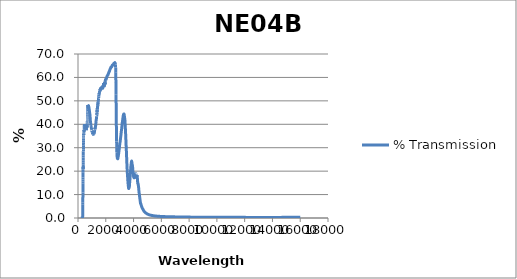
| Category | % Transmission |
|---|---|
| 200.0 | 0.014 |
| 201.0 | 0.014 |
| 202.0 | 0.014 |
| 203.0 | 0.013 |
| 204.0 | 0.013 |
| 205.0 | 0.013 |
| 206.0 | 0.013 |
| 207.0 | 0.013 |
| 208.0 | 0.013 |
| 209.0 | 0.013 |
| 210.0 | 0.013 |
| 211.0 | 0.013 |
| 212.0 | 0.013 |
| 213.0 | 0.013 |
| 214.0 | 0.012 |
| 215.0 | 0.012 |
| 216.0 | 0.012 |
| 217.0 | 0.012 |
| 218.0 | 0.012 |
| 219.0 | 0.012 |
| 220.0 | 0.012 |
| 221.0 | 0.012 |
| 222.0 | 0.012 |
| 223.0 | 0.012 |
| 224.0 | 0.012 |
| 225.0 | 0.012 |
| 226.0 | 0.012 |
| 227.0 | 0.012 |
| 228.0 | 0.011 |
| 229.0 | 0.011 |
| 230.0 | 0.011 |
| 231.0 | 0.011 |
| 232.0 | 0.011 |
| 233.0 | 0.011 |
| 234.0 | 0.011 |
| 235.0 | 0.011 |
| 236.0 | 0.011 |
| 237.0 | 0.011 |
| 238.0 | 0.011 |
| 239.0 | 0.011 |
| 240.0 | 0.011 |
| 241.0 | 0.011 |
| 242.0 | 0.011 |
| 243.0 | 0.011 |
| 244.0 | 0.011 |
| 245.0 | 0.011 |
| 246.0 | 0.011 |
| 247.0 | 0.01 |
| 248.0 | 0.01 |
| 249.0 | 0.01 |
| 250.0 | 0.01 |
| 251.0 | 0.01 |
| 252.0 | 0.01 |
| 253.0 | 0.01 |
| 254.0 | 0.01 |
| 255.0 | 0.01 |
| 256.0 | 0.01 |
| 257.0 | 0.01 |
| 258.0 | 0.01 |
| 259.0 | 0.01 |
| 260.0 | 0.01 |
| 261.0 | 0.01 |
| 262.0 | 0.01 |
| 263.0 | 0.01 |
| 264.0 | 0.01 |
| 265.0 | 0.01 |
| 266.0 | 0.01 |
| 267.0 | 0.01 |
| 268.0 | 0.01 |
| 269.0 | 0.01 |
| 270.0 | 0.01 |
| 271.0 | 0.01 |
| 272.0 | 0.01 |
| 273.0 | 0.01 |
| 274.0 | 0.01 |
| 275.0 | 0.01 |
| 276.0 | 0.009 |
| 277.0 | 0.009 |
| 278.0 | 0.009 |
| 279.0 | 0.009 |
| 280.0 | 0.009 |
| 281.0 | 0.009 |
| 282.0 | 0.009 |
| 283.0 | 0.009 |
| 284.0 | 0.009 |
| 285.0 | 0.009 |
| 286.0 | 0.009 |
| 287.0 | 0.009 |
| 288.0 | 0.009 |
| 289.0 | 0.009 |
| 290.0 | 0.009 |
| 291.0 | 0.009 |
| 292.0 | 0.009 |
| 293.0 | 0.009 |
| 294.0 | 0.009 |
| 295.0 | 0.009 |
| 296.0 | 0.009 |
| 297.0 | 0.009 |
| 298.0 | 0.009 |
| 299.0 | 0.009 |
| 300.0 | 0.009 |
| 301.0 | 0.009 |
| 302.0 | 0.009 |
| 303.0 | 0.009 |
| 304.0 | 0.009 |
| 305.0 | 0.009 |
| 306.0 | 0.009 |
| 307.0 | 0.009 |
| 308.0 | 0.009 |
| 309.0 | 0.009 |
| 310.0 | 0.009 |
| 311.0 | 0.009 |
| 312.0 | 0.008 |
| 313.0 | 0.008 |
| 314.0 | 0.008 |
| 315.0 | 0.009 |
| 316.0 | 0.009 |
| 317.0 | 0.009 |
| 318.0 | 0.009 |
| 319.0 | 0.009 |
| 320.0 | 0.01 |
| 321.0 | 0.012 |
| 322.0 | 0.016 |
| 323.0 | 0.021 |
| 324.0 | 0.029 |
| 325.0 | 0.041 |
| 326.0 | 0.059 |
| 327.0 | 0.085 |
| 328.0 | 0.121 |
| 329.0 | 0.169 |
| 330.0 | 0.232 |
| 331.0 | 0.314 |
| 332.0 | 0.415 |
| 333.0 | 0.539 |
| 334.0 | 0.689 |
| 335.0 | 0.864 |
| 336.0 | 1.076 |
| 337.0 | 1.328 |
| 338.0 | 1.615 |
| 339.0 | 1.95 |
| 340.0 | 2.317 |
| 341.0 | 2.71 |
| 342.0 | 3.146 |
| 343.0 | 3.609 |
| 344.0 | 4.122 |
| 345.0 | 4.671 |
| 346.0 | 5.268 |
| 347.0 | 5.849 |
| 348.0 | 6.501 |
| 349.0 | 7.184 |
| 350.0 | 7.915 |
| 351.0 | 8.671 |
| 352.0 | 9.423 |
| 353.0 | 10.109 |
| 354.0 | 10.876 |
| 355.0 | 11.64 |
| 356.0 | 12.471 |
| 357.0 | 13.306 |
| 358.0 | 14.129 |
| 359.0 | 14.825 |
| 360.0 | 15.651 |
| 361.0 | 16.417 |
| 362.0 | 17.251 |
| 363.0 | 18.032 |
| 364.0 | 18.768 |
| 365.0 | 19.354 |
| 366.0 | 20.043 |
| 367.0 | 20.587 |
| 368.0 | 21.141 |
| 369.0 | 21.621 |
| 370.0 | 21.908 |
| 371.0 | 21.957 |
| 372.0 | 21.927 |
| 373.0 | 21.721 |
| 374.0 | 21.499 |
| 375.0 | 21.261 |
| 376.0 | 21.044 |
| 377.0 | 20.895 |
| 378.0 | 21.173 |
| 379.0 | 21.612 |
| 380.0 | 22.243 |
| 381.0 | 22.912 |
| 382.0 | 23.807 |
| 383.0 | 24.694 |
| 384.0 | 25.788 |
| 385.0 | 26.821 |
| 386.0 | 27.727 |
| 387.0 | 28.405 |
| 388.0 | 29.284 |
| 389.0 | 30.03 |
| 390.0 | 30.824 |
| 391.0 | 31.533 |
| 392.0 | 32.12 |
| 393.0 | 32.421 |
| 394.0 | 32.936 |
| 395.0 | 33.403 |
| 396.0 | 33.937 |
| 397.0 | 34.357 |
| 398.0 | 34.65 |
| 399.0 | 34.695 |
| 400.0 | 34.957 |
| 401.0 | 35.078 |
| 402.0 | 35.328 |
| 403.0 | 35.605 |
| 404.0 | 35.725 |
| 405.0 | 35.484 |
| 406.0 | 35.491 |
| 407.0 | 35.552 |
| 408.0 | 35.72 |
| 409.0 | 35.763 |
| 410.0 | 35.706 |
| 411.0 | 35.513 |
| 412.0 | 35.542 |
| 413.0 | 35.61 |
| 414.0 | 35.714 |
| 415.0 | 35.903 |
| 416.0 | 35.92 |
| 417.0 | 35.815 |
| 418.0 | 35.901 |
| 419.0 | 36.111 |
| 420.0 | 36.296 |
| 421.0 | 36.531 |
| 422.0 | 36.579 |
| 423.0 | 36.506 |
| 424.0 | 36.611 |
| 425.0 | 36.811 |
| 426.0 | 37 |
| 427.0 | 37.225 |
| 428.0 | 37.27 |
| 429.0 | 37.184 |
| 430.0 | 37.217 |
| 431.0 | 37.282 |
| 432.0 | 37.375 |
| 433.0 | 37.427 |
| 434.0 | 37.357 |
| 435.0 | 37.225 |
| 436.0 | 37.156 |
| 437.0 | 37.15 |
| 438.0 | 37.191 |
| 439.0 | 37.335 |
| 440.0 | 37.315 |
| 441.0 | 37.159 |
| 442.0 | 37.176 |
| 443.0 | 37.343 |
| 444.0 | 37.511 |
| 445.0 | 37.74 |
| 446.0 | 37.821 |
| 447.0 | 37.85 |
| 448.0 | 38.027 |
| 449.0 | 38.209 |
| 450.0 | 38.467 |
| 451.0 | 38.783 |
| 452.0 | 38.897 |
| 453.0 | 38.87 |
| 454.0 | 39.03 |
| 455.0 | 39.162 |
| 456.0 | 39.364 |
| 457.0 | 39.58 |
| 458.0 | 39.622 |
| 459.0 | 39.539 |
| 460.0 | 39.544 |
| 461.0 | 39.599 |
| 462.0 | 39.8 |
| 463.0 | 39.984 |
| 464.0 | 39.869 |
| 465.0 | 39.673 |
| 466.0 | 39.695 |
| 467.0 | 39.631 |
| 468.0 | 39.751 |
| 469.0 | 39.915 |
| 470.0 | 39.73 |
| 471.0 | 39.461 |
| 472.0 | 39.421 |
| 473.0 | 39.383 |
| 474.0 | 39.466 |
| 475.0 | 39.574 |
| 476.0 | 39.414 |
| 477.0 | 39.154 |
| 478.0 | 39.105 |
| 479.0 | 39.043 |
| 480.0 | 39.098 |
| 481.0 | 39.18 |
| 482.0 | 38.994 |
| 483.0 | 38.76 |
| 484.0 | 38.713 |
| 485.0 | 38.649 |
| 486.0 | 38.707 |
| 487.0 | 38.753 |
| 488.0 | 38.607 |
| 489.0 | 38.439 |
| 490.0 | 38.406 |
| 491.0 | 38.359 |
| 492.0 | 38.407 |
| 493.0 | 38.47 |
| 494.0 | 38.325 |
| 495.0 | 38.166 |
| 496.0 | 38.145 |
| 497.0 | 38.157 |
| 498.0 | 38.235 |
| 499.0 | 38.259 |
| 500.0 | 38.136 |
| 501.0 | 37.986 |
| 502.0 | 37.975 |
| 503.0 | 38.002 |
| 504.0 | 38.087 |
| 505.0 | 38.188 |
| 506.0 | 38.071 |
| 507.0 | 37.942 |
| 508.0 | 37.948 |
| 509.0 | 37.961 |
| 510.0 | 38.061 |
| 511.0 | 38.17 |
| 512.0 | 38.08 |
| 513.0 | 38.018 |
| 514.0 | 38.054 |
| 515.0 | 38.093 |
| 516.0 | 38.249 |
| 517.0 | 38.371 |
| 518.0 | 38.298 |
| 519.0 | 38.241 |
| 520.0 | 38.254 |
| 521.0 | 38.337 |
| 522.0 | 38.503 |
| 523.0 | 38.612 |
| 524.0 | 38.558 |
| 525.0 | 38.535 |
| 526.0 | 38.59 |
| 527.0 | 38.659 |
| 528.0 | 38.819 |
| 529.0 | 38.97 |
| 530.0 | 38.922 |
| 531.0 | 38.887 |
| 532.0 | 38.959 |
| 533.0 | 39.034 |
| 534.0 | 39.155 |
| 535.0 | 39.303 |
| 536.0 | 39.274 |
| 537.0 | 39.272 |
| 538.0 | 39.343 |
| 539.0 | 39.401 |
| 540.0 | 39.614 |
| 541.0 | 39.674 |
| 542.0 | 39.533 |
| 543.0 | 39.517 |
| 544.0 | 39.53 |
| 545.0 | 39.676 |
| 546.0 | 39.809 |
| 547.0 | 39.864 |
| 548.0 | 39.697 |
| 549.0 | 39.63 |
| 550.0 | 39.633 |
| 551.0 | 39.704 |
| 552.0 | 39.802 |
| 553.0 | 39.659 |
| 554.0 | 39.559 |
| 555.0 | 39.51 |
| 556.0 | 39.521 |
| 557.0 | 39.582 |
| 558.0 | 39.53 |
| 559.0 | 39.574 |
| 560.0 | 39.389 |
| 561.0 | 39.413 |
| 562.0 | 39.271 |
| 563.0 | 39.17 |
| 564.0 | 39.159 |
| 565.0 | 39.142 |
| 566.0 | 39.191 |
| 567.0 | 39.055 |
| 568.0 | 38.849 |
| 569.0 | 38.756 |
| 570.0 | 38.643 |
| 571.0 | 38.659 |
| 572.0 | 38.739 |
| 573.0 | 38.537 |
| 574.0 | 38.367 |
| 575.0 | 38.325 |
| 576.0 | 38.181 |
| 577.0 | 38.236 |
| 578.0 | 38.269 |
| 579.0 | 38.132 |
| 580.0 | 37.913 |
| 581.0 | 37.882 |
| 582.0 | 37.764 |
| 583.0 | 37.847 |
| 584.0 | 37.907 |
| 585.0 | 37.739 |
| 586.0 | 37.653 |
| 587.0 | 37.632 |
| 588.0 | 37.529 |
| 589.0 | 37.653 |
| 590.0 | 37.727 |
| 591.0 | 37.577 |
| 592.0 | 37.541 |
| 593.0 | 37.611 |
| 594.0 | 37.501 |
| 595.0 | 37.678 |
| 596.0 | 37.788 |
| 597.0 | 37.707 |
| 598.0 | 37.63 |
| 599.0 | 37.754 |
| 600.0 | 37.744 |
| 601.0 | 37.883 |
| 602.0 | 37.961 |
| 603.0 | 37.889 |
| 604.0 | 37.871 |
| 605.0 | 37.997 |
| 606.0 | 37.952 |
| 607.0 | 38.136 |
| 608.0 | 38.288 |
| 609.0 | 38.19 |
| 610.0 | 38.169 |
| 611.0 | 38.293 |
| 612.0 | 38.287 |
| 613.0 | 38.448 |
| 614.0 | 38.58 |
| 615.0 | 38.467 |
| 616.0 | 38.475 |
| 617.0 | 38.549 |
| 618.0 | 38.576 |
| 619.0 | 38.727 |
| 620.0 | 38.843 |
| 621.0 | 38.678 |
| 622.0 | 38.718 |
| 623.0 | 38.772 |
| 624.0 | 38.737 |
| 625.0 | 38.912 |
| 626.0 | 39.067 |
| 627.0 | 38.807 |
| 628.0 | 38.819 |
| 629.0 | 38.856 |
| 630.0 | 38.909 |
| 631.0 | 38.961 |
| 632.0 | 39.06 |
| 633.0 | 38.803 |
| 634.0 | 38.804 |
| 635.0 | 38.839 |
| 636.0 | 38.807 |
| 637.0 | 38.887 |
| 638.0 | 39.025 |
| 639.0 | 38.837 |
| 640.0 | 38.768 |
| 641.0 | 38.768 |
| 642.0 | 38.826 |
| 643.0 | 38.887 |
| 644.0 | 38.872 |
| 645.0 | 38.784 |
| 646.0 | 38.782 |
| 647.0 | 38.852 |
| 648.0 | 38.858 |
| 649.0 | 38.941 |
| 650.0 | 39.1 |
| 651.0 | 38.953 |
| 652.0 | 38.97 |
| 653.0 | 38.979 |
| 654.0 | 38.99 |
| 655.0 | 39.248 |
| 656.0 | 39.431 |
| 657.0 | 39.194 |
| 658.0 | 39.235 |
| 659.0 | 39.395 |
| 660.0 | 39.432 |
| 661.0 | 39.67 |
| 662.0 | 39.79 |
| 663.0 | 39.714 |
| 664.0 | 39.721 |
| 665.0 | 40.02 |
| 666.0 | 40.038 |
| 667.0 | 40.316 |
| 668.0 | 40.615 |
| 669.0 | 40.581 |
| 670.0 | 40.635 |
| 671.0 | 40.872 |
| 672.0 | 41.097 |
| 673.0 | 41.4 |
| 674.0 | 41.468 |
| 675.0 | 41.52 |
| 676.0 | 41.605 |
| 677.0 | 41.969 |
| 678.0 | 42.021 |
| 679.0 | 42.516 |
| 680.0 | 42.697 |
| 681.0 | 42.777 |
| 682.0 | 42.97 |
| 683.0 | 43.318 |
| 684.0 | 43.426 |
| 685.0 | 43.812 |
| 686.0 | 43.896 |
| 687.0 | 44.071 |
| 688.0 | 44.147 |
| 689.0 | 44.659 |
| 690.0 | 44.64 |
| 691.0 | 44.746 |
| 692.0 | 45.063 |
| 693.0 | 45.398 |
| 694.0 | 45.428 |
| 695.0 | 45.652 |
| 696.0 | 45.692 |
| 697.0 | 46.054 |
| 698.0 | 46.145 |
| 699.0 | 46.254 |
| 700.0 | 46.209 |
| 701.0 | 46.462 |
| 702.0 | 46.462 |
| 703.0 | 46.744 |
| 704.0 | 46.976 |
| 705.0 | 46.895 |
| 706.0 | 46.892 |
| 707.0 | 46.941 |
| 708.0 | 46.922 |
| 709.0 | 47.31 |
| 710.0 | 47.553 |
| 711.0 | 47.272 |
| 712.0 | 47.367 |
| 713.0 | 47.536 |
| 714.0 | 47.573 |
| 715.0 | 47.817 |
| 716.0 | 47.808 |
| 717.0 | 47.767 |
| 718.0 | 47.685 |
| 719.0 | 47.78 |
| 720.0 | 47.71 |
| 721.0 | 47.998 |
| 722.0 | 48.028 |
| 723.0 | 47.787 |
| 724.0 | 47.852 |
| 725.0 | 47.916 |
| 726.0 | 47.904 |
| 727.0 | 48.005 |
| 728.0 | 48.06 |
| 729.0 | 47.864 |
| 730.0 | 47.927 |
| 731.0 | 47.908 |
| 732.0 | 47.854 |
| 733.0 | 48.018 |
| 734.0 | 48.174 |
| 735.0 | 47.877 |
| 736.0 | 47.867 |
| 737.0 | 47.995 |
| 738.0 | 47.888 |
| 739.0 | 48.028 |
| 740.0 | 48.169 |
| 741.0 | 47.812 |
| 742.0 | 47.856 |
| 743.0 | 47.888 |
| 744.0 | 47.872 |
| 745.0 | 47.926 |
| 746.0 | 48.109 |
| 747.0 | 47.722 |
| 748.0 | 47.665 |
| 749.0 | 47.642 |
| 750.0 | 47.9 |
| 751.0 | 47.9 |
| 752.0 | 47.901 |
| 753.0 | 47.91 |
| 754.0 | 47.899 |
| 755.0 | 47.882 |
| 756.0 | 47.876 |
| 757.0 | 47.867 |
| 758.0 | 47.858 |
| 759.0 | 47.854 |
| 760.0 | 47.837 |
| 761.0 | 47.817 |
| 762.0 | 47.803 |
| 763.0 | 47.787 |
| 764.0 | 47.774 |
| 765.0 | 47.765 |
| 766.0 | 47.742 |
| 767.0 | 47.71 |
| 768.0 | 47.687 |
| 769.0 | 47.663 |
| 770.0 | 47.639 |
| 771.0 | 47.621 |
| 772.0 | 47.591 |
| 773.0 | 47.553 |
| 774.0 | 47.526 |
| 775.0 | 47.499 |
| 776.0 | 47.474 |
| 777.0 | 47.451 |
| 778.0 | 47.418 |
| 779.0 | 47.374 |
| 780.0 | 47.341 |
| 781.0 | 47.313 |
| 782.0 | 47.288 |
| 783.0 | 47.261 |
| 784.0 | 47.224 |
| 785.0 | 47.176 |
| 786.0 | 47.136 |
| 787.0 | 47.104 |
| 788.0 | 47.073 |
| 789.0 | 47.043 |
| 790.0 | 47.004 |
| 791.0 | 46.959 |
| 792.0 | 46.923 |
| 793.0 | 46.884 |
| 794.0 | 46.851 |
| 795.0 | 46.819 |
| 796.0 | 46.775 |
| 797.0 | 46.726 |
| 798.0 | 46.686 |
| 799.0 | 46.648 |
| 800.0 | 46.617 |
| 801.0 | 46.584 |
| 802.0 | 46.541 |
| 803.0 | 46.491 |
| 804.0 | 46.447 |
| 805.0 | 46.408 |
| 806.0 | 46.373 |
| 807.0 | 46.334 |
| 808.0 | 46.289 |
| 809.0 | 46.239 |
| 810.0 | 46.199 |
| 811.0 | 46.157 |
| 812.0 | 46.115 |
| 813.0 | 46.069 |
| 814.0 | 46.023 |
| 815.0 | 45.982 |
| 816.0 | 45.944 |
| 817.0 | 45.901 |
| 818.0 | 45.86 |
| 819.0 | 45.815 |
| 820.0 | 45.766 |
| 821.0 | 45.721 |
| 822.0 | 45.682 |
| 823.0 | 45.637 |
| 824.0 | 45.586 |
| 825.0 | 45.542 |
| 826.0 | 45.493 |
| 827.0 | 45.446 |
| 828.0 | 45.409 |
| 829.0 | 45.368 |
| 830.0 | 45.323 |
| 831.0 | 45.279 |
| 832.0 | 45.231 |
| 833.0 | 45.188 |
| 834.0 | 45.15 |
| 835.0 | 45.106 |
| 836.0 | 45.06 |
| 837.0 | 45.016 |
| 838.0 | 44.969 |
| 839.0 | 44.927 |
| 840.0 | 44.885 |
| 841.0 | 44.839 |
| 842.0 | 44.793 |
| 843.0 | 44.752 |
| 844.0 | 44.706 |
| 845.0 | 44.663 |
| 846.0 | 44.624 |
| 847.0 | 44.576 |
| 848.0 | 44.524 |
| 849.0 | 44.48 |
| 850.0 | 44.437 |
| 851.0 | 44.397 |
| 852.0 | 44.36 |
| 853.0 | 44.311 |
| 854.0 | 44.261 |
| 855.0 | 44.219 |
| 856.0 | 44.185 |
| 857.0 | 44.147 |
| 858.0 | 44.107 |
| 859.0 | 44.06 |
| 860.0 | 44.012 |
| 861.0 | 43.96 |
| 862.0 | 43.895 |
| 863.0 | 43.838 |
| 864.0 | 43.771 |
| 865.0 | 43.697 |
| 866.0 | 43.616 |
| 867.0 | 43.528 |
| 868.0 | 43.448 |
| 869.0 | 43.379 |
| 870.0 | 43.328 |
| 871.0 | 43.27 |
| 872.0 | 43.174 |
| 873.0 | 43.053 |
| 874.0 | 42.934 |
| 875.0 | 42.847 |
| 876.0 | 42.793 |
| 877.0 | 42.738 |
| 878.0 | 42.67 |
| 879.0 | 42.602 |
| 880.0 | 42.539 |
| 881.0 | 42.441 |
| 882.0 | 42.326 |
| 883.0 | 42.223 |
| 884.0 | 42.116 |
| 885.0 | 42.012 |
| 886.0 | 41.934 |
| 887.0 | 41.883 |
| 888.0 | 41.836 |
| 889.0 | 41.764 |
| 890.0 | 41.661 |
| 891.0 | 41.554 |
| 892.0 | 41.445 |
| 893.0 | 41.37 |
| 894.0 | 41.339 |
| 895.0 | 41.305 |
| 896.0 | 41.259 |
| 897.0 | 41.203 |
| 898.0 | 41.159 |
| 899.0 | 41.138 |
| 900.0 | 41.089 |
| 901.0 | 41.011 |
| 902.0 | 40.928 |
| 903.0 | 40.857 |
| 904.0 | 40.807 |
| 905.0 | 40.779 |
| 906.0 | 40.766 |
| 907.0 | 40.731 |
| 908.0 | 40.642 |
| 909.0 | 40.556 |
| 910.0 | 40.527 |
| 911.0 | 40.512 |
| 912.0 | 40.464 |
| 913.0 | 40.407 |
| 914.0 | 40.373 |
| 915.0 | 40.365 |
| 916.0 | 40.366 |
| 917.0 | 40.343 |
| 918.0 | 40.28 |
| 919.0 | 40.197 |
| 920.0 | 40.095 |
| 921.0 | 40.019 |
| 922.0 | 39.993 |
| 923.0 | 39.987 |
| 924.0 | 39.982 |
| 925.0 | 39.947 |
| 926.0 | 39.857 |
| 927.0 | 39.771 |
| 928.0 | 39.74 |
| 929.0 | 39.707 |
| 930.0 | 39.623 |
| 931.0 | 39.556 |
| 932.0 | 39.557 |
| 933.0 | 39.543 |
| 934.0 | 39.494 |
| 935.0 | 39.458 |
| 936.0 | 39.423 |
| 937.0 | 39.406 |
| 938.0 | 39.4 |
| 939.0 | 39.361 |
| 940.0 | 39.307 |
| 941.0 | 39.254 |
| 942.0 | 39.196 |
| 943.0 | 39.138 |
| 944.0 | 39.091 |
| 945.0 | 39.075 |
| 946.0 | 39.026 |
| 947.0 | 38.964 |
| 948.0 | 38.944 |
| 949.0 | 38.943 |
| 950.0 | 38.908 |
| 951.0 | 38.834 |
| 952.0 | 38.809 |
| 953.0 | 38.816 |
| 954.0 | 38.785 |
| 955.0 | 38.714 |
| 956.0 | 38.64 |
| 957.0 | 38.589 |
| 958.0 | 38.594 |
| 959.0 | 38.57 |
| 960.0 | 38.495 |
| 961.0 | 38.445 |
| 962.0 | 38.436 |
| 963.0 | 38.431 |
| 964.0 | 38.378 |
| 965.0 | 38.333 |
| 966.0 | 38.325 |
| 967.0 | 38.275 |
| 968.0 | 38.231 |
| 969.0 | 38.219 |
| 970.0 | 38.176 |
| 971.0 | 38.118 |
| 972.0 | 38.09 |
| 973.0 | 38.084 |
| 974.0 | 38.013 |
| 975.0 | 37.972 |
| 976.0 | 37.962 |
| 977.0 | 37.948 |
| 978.0 | 37.927 |
| 979.0 | 37.86 |
| 980.0 | 37.772 |
| 981.0 | 37.701 |
| 982.0 | 37.716 |
| 983.0 | 37.736 |
| 984.0 | 37.708 |
| 985.0 | 37.653 |
| 986.0 | 37.644 |
| 987.0 | 37.633 |
| 988.0 | 37.598 |
| 989.0 | 37.555 |
| 990.0 | 37.514 |
| 991.0 | 37.489 |
| 992.0 | 37.462 |
| 993.0 | 37.463 |
| 994.0 | 37.473 |
| 995.0 | 37.429 |
| 996.0 | 37.356 |
| 997.0 | 37.3 |
| 998.0 | 37.273 |
| 999.0 | 37.271 |
| 1000.0 | 37.267 |
| 1001.0 | 37.19 |
| 1002.0 | 37.141 |
| 1003.0 | 37.141 |
| 1004.0 | 37.148 |
| 1005.0 | 37.125 |
| 1006.0 | 37.112 |
| 1007.0 | 37.081 |
| 1008.0 | 37.043 |
| 1009.0 | 37.007 |
| 1010.0 | 36.995 |
| 1011.0 | 37.007 |
| 1012.0 | 37.031 |
| 1013.0 | 37.044 |
| 1014.0 | 36.995 |
| 1015.0 | 36.955 |
| 1016.0 | 36.908 |
| 1017.0 | 36.878 |
| 1018.0 | 36.863 |
| 1019.0 | 36.849 |
| 1020.0 | 36.85 |
| 1021.0 | 36.833 |
| 1022.0 | 36.772 |
| 1023.0 | 36.699 |
| 1024.0 | 36.703 |
| 1025.0 | 36.68 |
| 1026.0 | 36.635 |
| 1027.0 | 36.591 |
| 1028.0 | 36.569 |
| 1029.0 | 36.598 |
| 1030.0 | 36.592 |
| 1031.0 | 36.582 |
| 1032.0 | 36.562 |
| 1033.0 | 36.546 |
| 1034.0 | 36.501 |
| 1035.0 | 36.492 |
| 1036.0 | 36.493 |
| 1037.0 | 36.486 |
| 1038.0 | 36.485 |
| 1039.0 | 36.447 |
| 1040.0 | 36.367 |
| 1041.0 | 36.317 |
| 1042.0 | 36.33 |
| 1043.0 | 36.332 |
| 1044.0 | 36.286 |
| 1045.0 | 36.247 |
| 1046.0 | 36.215 |
| 1047.0 | 36.197 |
| 1048.0 | 36.229 |
| 1049.0 | 36.237 |
| 1050.0 | 36.192 |
| 1051.0 | 36.16 |
| 1052.0 | 36.142 |
| 1053.0 | 36.13 |
| 1054.0 | 36.12 |
| 1055.0 | 36.119 |
| 1056.0 | 36.098 |
| 1057.0 | 36.061 |
| 1058.0 | 36.03 |
| 1059.0 | 36.031 |
| 1060.0 | 36.036 |
| 1061.0 | 35.993 |
| 1062.0 | 35.989 |
| 1063.0 | 35.984 |
| 1064.0 | 35.998 |
| 1065.0 | 36.027 |
| 1066.0 | 36.04 |
| 1067.0 | 36.005 |
| 1068.0 | 35.961 |
| 1069.0 | 35.923 |
| 1070.0 | 35.858 |
| 1071.0 | 35.827 |
| 1072.0 | 35.89 |
| 1073.0 | 35.947 |
| 1074.0 | 35.948 |
| 1075.0 | 35.936 |
| 1076.0 | 35.905 |
| 1077.0 | 35.859 |
| 1078.0 | 35.839 |
| 1079.0 | 35.868 |
| 1080.0 | 35.885 |
| 1081.0 | 35.877 |
| 1082.0 | 35.876 |
| 1083.0 | 35.883 |
| 1084.0 | 35.845 |
| 1085.0 | 35.824 |
| 1086.0 | 35.866 |
| 1087.0 | 35.912 |
| 1088.0 | 35.921 |
| 1089.0 | 35.942 |
| 1090.0 | 35.962 |
| 1091.0 | 35.951 |
| 1092.0 | 35.922 |
| 1093.0 | 35.892 |
| 1094.0 | 35.87 |
| 1095.0 | 35.854 |
| 1096.0 | 35.834 |
| 1097.0 | 35.829 |
| 1098.0 | 35.836 |
| 1099.0 | 35.824 |
| 1100.0 | 35.784 |
| 1101.0 | 35.768 |
| 1102.0 | 35.829 |
| 1103.0 | 35.882 |
| 1104.0 | 35.887 |
| 1105.0 | 35.876 |
| 1106.0 | 35.862 |
| 1107.0 | 35.85 |
| 1108.0 | 35.83 |
| 1109.0 | 35.819 |
| 1110.0 | 35.793 |
| 1111.0 | 35.735 |
| 1112.0 | 35.708 |
| 1113.0 | 35.706 |
| 1114.0 | 35.699 |
| 1115.0 | 35.705 |
| 1116.0 | 35.757 |
| 1117.0 | 35.794 |
| 1118.0 | 35.786 |
| 1119.0 | 35.773 |
| 1120.0 | 35.767 |
| 1121.0 | 35.777 |
| 1122.0 | 35.801 |
| 1123.0 | 35.837 |
| 1124.0 | 35.869 |
| 1125.0 | 35.889 |
| 1126.0 | 35.87 |
| 1127.0 | 35.904 |
| 1128.0 | 35.943 |
| 1129.0 | 35.984 |
| 1130.0 | 36.01 |
| 1131.0 | 36 |
| 1132.0 | 35.963 |
| 1133.0 | 35.939 |
| 1134.0 | 35.904 |
| 1135.0 | 35.932 |
| 1136.0 | 35.937 |
| 1137.0 | 35.936 |
| 1138.0 | 35.953 |
| 1139.0 | 35.985 |
| 1140.0 | 36.042 |
| 1141.0 | 36.073 |
| 1142.0 | 36.089 |
| 1143.0 | 36.087 |
| 1144.0 | 36.034 |
| 1145.0 | 35.992 |
| 1146.0 | 35.985 |
| 1147.0 | 36.029 |
| 1148.0 | 36.057 |
| 1149.0 | 36.106 |
| 1150.0 | 36.142 |
| 1151.0 | 36.176 |
| 1152.0 | 36.209 |
| 1153.0 | 36.19 |
| 1154.0 | 36.162 |
| 1155.0 | 36.139 |
| 1156.0 | 36.135 |
| 1157.0 | 36.128 |
| 1158.0 | 36.106 |
| 1159.0 | 36.049 |
| 1160.0 | 36.051 |
| 1161.0 | 36.058 |
| 1162.0 | 36.088 |
| 1163.0 | 36.146 |
| 1164.0 | 36.259 |
| 1165.0 | 36.34 |
| 1166.0 | 36.387 |
| 1167.0 | 36.367 |
| 1168.0 | 36.36 |
| 1169.0 | 36.375 |
| 1170.0 | 36.376 |
| 1171.0 | 36.372 |
| 1172.0 | 36.379 |
| 1173.0 | 36.412 |
| 1174.0 | 36.459 |
| 1175.0 | 36.492 |
| 1176.0 | 36.51 |
| 1177.0 | 36.546 |
| 1178.0 | 36.603 |
| 1179.0 | 36.609 |
| 1180.0 | 36.628 |
| 1181.0 | 36.641 |
| 1182.0 | 36.665 |
| 1183.0 | 36.703 |
| 1184.0 | 36.741 |
| 1185.0 | 36.81 |
| 1186.0 | 36.896 |
| 1187.0 | 36.997 |
| 1188.0 | 37.123 |
| 1189.0 | 37.274 |
| 1190.0 | 37.401 |
| 1191.0 | 37.445 |
| 1192.0 | 37.436 |
| 1193.0 | 37.423 |
| 1194.0 | 37.41 |
| 1195.0 | 37.411 |
| 1196.0 | 37.409 |
| 1197.0 | 37.415 |
| 1198.0 | 37.458 |
| 1199.0 | 37.493 |
| 1200.0 | 37.518 |
| 1201.0 | 37.531 |
| 1202.0 | 37.572 |
| 1203.0 | 37.628 |
| 1204.0 | 37.693 |
| 1205.0 | 37.785 |
| 1206.0 | 37.882 |
| 1207.0 | 37.981 |
| 1208.0 | 38.092 |
| 1209.0 | 38.158 |
| 1210.0 | 38.164 |
| 1211.0 | 38.157 |
| 1212.0 | 38.149 |
| 1213.0 | 38.13 |
| 1214.0 | 38.11 |
| 1215.0 | 38.082 |
| 1216.0 | 38.048 |
| 1217.0 | 38.028 |
| 1218.0 | 38.019 |
| 1219.0 | 38.026 |
| 1220.0 | 37.998 |
| 1221.0 | 37.933 |
| 1222.0 | 37.902 |
| 1223.0 | 37.951 |
| 1224.0 | 38.005 |
| 1225.0 | 38.032 |
| 1226.0 | 38.032 |
| 1227.0 | 38.037 |
| 1228.0 | 38.059 |
| 1229.0 | 38.082 |
| 1230.0 | 38.062 |
| 1231.0 | 38.042 |
| 1232.0 | 38.033 |
| 1233.0 | 38.031 |
| 1234.0 | 38.037 |
| 1235.0 | 38.069 |
| 1236.0 | 38.086 |
| 1237.0 | 38.087 |
| 1238.0 | 38.099 |
| 1239.0 | 38.133 |
| 1240.0 | 38.176 |
| 1241.0 | 38.235 |
| 1242.0 | 38.311 |
| 1243.0 | 38.394 |
| 1244.0 | 38.476 |
| 1245.0 | 38.549 |
| 1246.0 | 38.601 |
| 1247.0 | 38.652 |
| 1248.0 | 38.7 |
| 1249.0 | 38.732 |
| 1250.0 | 38.747 |
| 1251.0 | 38.746 |
| 1252.0 | 38.767 |
| 1253.0 | 38.784 |
| 1254.0 | 38.778 |
| 1255.0 | 38.768 |
| 1256.0 | 38.765 |
| 1257.0 | 38.795 |
| 1258.0 | 38.876 |
| 1259.0 | 38.987 |
| 1260.0 | 39.113 |
| 1261.0 | 39.24 |
| 1262.0 | 39.336 |
| 1263.0 | 39.383 |
| 1264.0 | 39.418 |
| 1265.0 | 39.462 |
| 1266.0 | 39.485 |
| 1267.0 | 39.478 |
| 1268.0 | 39.475 |
| 1269.0 | 39.476 |
| 1270.0 | 39.476 |
| 1271.0 | 39.484 |
| 1272.0 | 39.492 |
| 1273.0 | 39.506 |
| 1274.0 | 39.528 |
| 1275.0 | 39.558 |
| 1276.0 | 39.603 |
| 1277.0 | 39.659 |
| 1278.0 | 39.725 |
| 1279.0 | 39.773 |
| 1280.0 | 39.819 |
| 1281.0 | 39.858 |
| 1282.0 | 39.892 |
| 1283.0 | 39.961 |
| 1284.0 | 40.07 |
| 1285.0 | 40.186 |
| 1286.0 | 40.295 |
| 1287.0 | 40.404 |
| 1288.0 | 40.509 |
| 1289.0 | 40.59 |
| 1290.0 | 40.649 |
| 1291.0 | 40.689 |
| 1292.0 | 40.706 |
| 1293.0 | 40.688 |
| 1294.0 | 40.688 |
| 1295.0 | 40.75 |
| 1296.0 | 40.843 |
| 1297.0 | 40.952 |
| 1298.0 | 41.069 |
| 1299.0 | 41.199 |
| 1300.0 | 41.317 |
| 1301.0 | 41.386 |
| 1302.0 | 41.427 |
| 1303.0 | 41.465 |
| 1304.0 | 41.511 |
| 1305.0 | 41.569 |
| 1306.0 | 41.638 |
| 1307.0 | 41.7 |
| 1308.0 | 41.737 |
| 1309.0 | 41.742 |
| 1310.0 | 41.759 |
| 1311.0 | 41.803 |
| 1312.0 | 41.858 |
| 1313.0 | 41.936 |
| 1314.0 | 42.028 |
| 1315.0 | 42.087 |
| 1316.0 | 42.121 |
| 1317.0 | 42.153 |
| 1318.0 | 42.189 |
| 1319.0 | 42.212 |
| 1320.0 | 42.224 |
| 1321.0 | 42.247 |
| 1322.0 | 42.282 |
| 1323.0 | 42.32 |
| 1324.0 | 42.371 |
| 1325.0 | 42.451 |
| 1326.0 | 42.546 |
| 1327.0 | 42.637 |
| 1328.0 | 42.707 |
| 1329.0 | 42.727 |
| 1330.0 | 42.724 |
| 1331.0 | 42.707 |
| 1332.0 | 42.707 |
| 1333.0 | 42.745 |
| 1334.0 | 42.799 |
| 1335.0 | 42.849 |
| 1336.0 | 42.895 |
| 1337.0 | 42.938 |
| 1338.0 | 42.98 |
| 1339.0 | 43.035 |
| 1340.0 | 43.143 |
| 1341.0 | 43.342 |
| 1342.0 | 43.541 |
| 1343.0 | 43.657 |
| 1344.0 | 43.702 |
| 1345.0 | 43.711 |
| 1346.0 | 43.765 |
| 1347.0 | 43.872 |
| 1348.0 | 44.004 |
| 1349.0 | 44.104 |
| 1350.0 | 44.195 |
| 1351.0 | 44.254 |
| 1352.0 | 44.231 |
| 1353.0 | 44.198 |
| 1354.0 | 44.242 |
| 1355.0 | 44.433 |
| 1356.0 | 44.631 |
| 1357.0 | 44.696 |
| 1358.0 | 44.609 |
| 1359.0 | 44.415 |
| 1360.0 | 44.285 |
| 1361.0 | 44.433 |
| 1362.0 | 44.679 |
| 1363.0 | 44.826 |
| 1364.0 | 44.965 |
| 1365.0 | 45.103 |
| 1366.0 | 45.092 |
| 1367.0 | 45.063 |
| 1368.0 | 45.107 |
| 1369.0 | 45.13 |
| 1370.0 | 45.209 |
| 1371.0 | 45.411 |
| 1372.0 | 45.528 |
| 1373.0 | 45.476 |
| 1374.0 | 45.419 |
| 1375.0 | 45.561 |
| 1376.0 | 45.836 |
| 1377.0 | 46.11 |
| 1378.0 | 46.13 |
| 1379.0 | 45.833 |
| 1380.0 | 45.48 |
| 1381.0 | 45.318 |
| 1382.0 | 45.356 |
| 1383.0 | 45.506 |
| 1384.0 | 45.715 |
| 1385.0 | 45.851 |
| 1386.0 | 45.878 |
| 1387.0 | 45.858 |
| 1388.0 | 46.003 |
| 1389.0 | 46.213 |
| 1390.0 | 46.344 |
| 1391.0 | 46.593 |
| 1392.0 | 46.822 |
| 1393.0 | 46.635 |
| 1394.0 | 46.38 |
| 1395.0 | 46.51 |
| 1396.0 | 46.765 |
| 1397.0 | 46.681 |
| 1398.0 | 46.569 |
| 1399.0 | 46.626 |
| 1400.0 | 46.959 |
| 1401.0 | 47.344 |
| 1402.0 | 47.343 |
| 1403.0 | 47.103 |
| 1404.0 | 46.999 |
| 1405.0 | 47.027 |
| 1406.0 | 47 |
| 1407.0 | 46.838 |
| 1408.0 | 46.709 |
| 1409.0 | 46.715 |
| 1410.0 | 46.878 |
| 1411.0 | 47.193 |
| 1412.0 | 47.455 |
| 1413.0 | 47.649 |
| 1414.0 | 47.835 |
| 1415.0 | 47.889 |
| 1416.0 | 47.883 |
| 1417.0 | 47.883 |
| 1418.0 | 47.978 |
| 1419.0 | 48.067 |
| 1420.0 | 47.91 |
| 1421.0 | 47.759 |
| 1422.0 | 47.859 |
| 1423.0 | 47.978 |
| 1424.0 | 48.081 |
| 1425.0 | 48.314 |
| 1426.0 | 48.498 |
| 1427.0 | 48.401 |
| 1428.0 | 48.202 |
| 1429.0 | 48.339 |
| 1430.0 | 48.682 |
| 1431.0 | 48.898 |
| 1432.0 | 48.787 |
| 1433.0 | 48.644 |
| 1434.0 | 48.792 |
| 1435.0 | 48.918 |
| 1436.0 | 48.979 |
| 1437.0 | 49.03 |
| 1438.0 | 49.139 |
| 1439.0 | 49.254 |
| 1440.0 | 49.291 |
| 1441.0 | 49.242 |
| 1442.0 | 49.234 |
| 1443.0 | 49.264 |
| 1444.0 | 49.392 |
| 1445.0 | 49.496 |
| 1446.0 | 49.438 |
| 1447.0 | 49.389 |
| 1448.0 | 49.423 |
| 1449.0 | 49.581 |
| 1450.0 | 49.718 |
| 1451.0 | 49.759 |
| 1452.0 | 49.83 |
| 1453.0 | 49.853 |
| 1454.0 | 49.868 |
| 1455.0 | 49.902 |
| 1456.0 | 49.931 |
| 1457.0 | 49.998 |
| 1458.0 | 50.123 |
| 1459.0 | 50.23 |
| 1460.0 | 50.264 |
| 1461.0 | 50.271 |
| 1462.0 | 50.295 |
| 1463.0 | 50.358 |
| 1464.0 | 50.36 |
| 1465.0 | 50.269 |
| 1466.0 | 50.228 |
| 1467.0 | 50.299 |
| 1468.0 | 50.349 |
| 1469.0 | 50.395 |
| 1470.0 | 50.469 |
| 1471.0 | 50.558 |
| 1472.0 | 50.603 |
| 1473.0 | 50.613 |
| 1474.0 | 50.626 |
| 1475.0 | 50.695 |
| 1476.0 | 50.775 |
| 1477.0 | 50.81 |
| 1478.0 | 50.846 |
| 1479.0 | 50.914 |
| 1480.0 | 50.993 |
| 1481.0 | 51.04 |
| 1482.0 | 51.026 |
| 1483.0 | 51.008 |
| 1484.0 | 51.022 |
| 1485.0 | 51.153 |
| 1486.0 | 51.294 |
| 1487.0 | 51.38 |
| 1488.0 | 51.475 |
| 1489.0 | 51.576 |
| 1490.0 | 51.649 |
| 1491.0 | 51.713 |
| 1492.0 | 51.755 |
| 1493.0 | 51.829 |
| 1494.0 | 51.881 |
| 1495.0 | 51.851 |
| 1496.0 | 51.872 |
| 1497.0 | 51.982 |
| 1498.0 | 52.081 |
| 1499.0 | 52.176 |
| 1500.0 | 52.245 |
| 1501.0 | 52.259 |
| 1502.0 | 52.272 |
| 1503.0 | 52.299 |
| 1504.0 | 52.366 |
| 1505.0 | 52.453 |
| 1506.0 | 52.551 |
| 1507.0 | 52.63 |
| 1508.0 | 52.616 |
| 1509.0 | 52.639 |
| 1510.0 | 52.681 |
| 1511.0 | 52.74 |
| 1512.0 | 52.811 |
| 1513.0 | 52.874 |
| 1514.0 | 52.905 |
| 1515.0 | 52.874 |
| 1516.0 | 52.877 |
| 1517.0 | 52.93 |
| 1518.0 | 52.984 |
| 1519.0 | 53.041 |
| 1520.0 | 53.056 |
| 1521.0 | 52.985 |
| 1522.0 | 52.904 |
| 1523.0 | 52.84 |
| 1524.0 | 52.862 |
| 1525.0 | 52.894 |
| 1526.0 | 52.961 |
| 1527.0 | 53.07 |
| 1528.0 | 53.123 |
| 1529.0 | 53.113 |
| 1530.0 | 53.09 |
| 1531.0 | 53.099 |
| 1532.0 | 53.125 |
| 1533.0 | 53.214 |
| 1534.0 | 53.281 |
| 1535.0 | 53.312 |
| 1536.0 | 53.338 |
| 1537.0 | 53.36 |
| 1538.0 | 53.393 |
| 1539.0 | 53.451 |
| 1540.0 | 53.526 |
| 1541.0 | 53.514 |
| 1542.0 | 53.51 |
| 1543.0 | 53.513 |
| 1544.0 | 53.506 |
| 1545.0 | 53.501 |
| 1546.0 | 53.568 |
| 1547.0 | 53.693 |
| 1548.0 | 53.802 |
| 1549.0 | 53.857 |
| 1550.0 | 53.84 |
| 1551.0 | 53.736 |
| 1552.0 | 53.639 |
| 1553.0 | 53.633 |
| 1554.0 | 53.669 |
| 1555.0 | 53.766 |
| 1556.0 | 53.864 |
| 1557.0 | 53.964 |
| 1558.0 | 54.006 |
| 1559.0 | 53.964 |
| 1560.0 | 53.915 |
| 1561.0 | 53.957 |
| 1562.0 | 54.054 |
| 1563.0 | 54.144 |
| 1564.0 | 54.236 |
| 1565.0 | 54.258 |
| 1566.0 | 54.211 |
| 1567.0 | 54.193 |
| 1568.0 | 54.209 |
| 1569.0 | 54.282 |
| 1570.0 | 54.33 |
| 1571.0 | 54.327 |
| 1572.0 | 54.294 |
| 1573.0 | 54.309 |
| 1574.0 | 54.316 |
| 1575.0 | 54.358 |
| 1576.0 | 54.439 |
| 1577.0 | 54.51 |
| 1578.0 | 54.516 |
| 1579.0 | 54.457 |
| 1580.0 | 54.382 |
| 1581.0 | 54.313 |
| 1582.0 | 54.301 |
| 1583.0 | 54.407 |
| 1584.0 | 54.578 |
| 1585.0 | 54.735 |
| 1586.0 | 54.81 |
| 1587.0 | 54.777 |
| 1588.0 | 54.743 |
| 1589.0 | 54.688 |
| 1590.0 | 54.642 |
| 1591.0 | 54.662 |
| 1592.0 | 54.711 |
| 1593.0 | 54.721 |
| 1594.0 | 54.666 |
| 1595.0 | 54.616 |
| 1596.0 | 54.575 |
| 1597.0 | 54.607 |
| 1598.0 | 54.703 |
| 1599.0 | 54.792 |
| 1600.0 | 54.835 |
| 1601.0 | 54.807 |
| 1602.0 | 54.793 |
| 1603.0 | 54.825 |
| 1604.0 | 54.882 |
| 1605.0 | 54.918 |
| 1606.0 | 54.967 |
| 1607.0 | 54.961 |
| 1608.0 | 54.891 |
| 1609.0 | 54.824 |
| 1610.0 | 54.807 |
| 1611.0 | 54.859 |
| 1612.0 | 54.902 |
| 1613.0 | 54.942 |
| 1614.0 | 54.983 |
| 1615.0 | 54.985 |
| 1616.0 | 54.918 |
| 1617.0 | 54.852 |
| 1618.0 | 54.853 |
| 1619.0 | 54.905 |
| 1620.0 | 54.954 |
| 1621.0 | 55.021 |
| 1622.0 | 55.093 |
| 1623.0 | 55.137 |
| 1624.0 | 55.13 |
| 1625.0 | 55.083 |
| 1626.0 | 55.079 |
| 1627.0 | 55.105 |
| 1628.0 | 55.13 |
| 1629.0 | 55.143 |
| 1630.0 | 55.162 |
| 1631.0 | 55.178 |
| 1632.0 | 55.18 |
| 1633.0 | 55.149 |
| 1634.0 | 55.098 |
| 1635.0 | 55.092 |
| 1636.0 | 55.155 |
| 1637.0 | 55.241 |
| 1638.0 | 55.275 |
| 1639.0 | 55.259 |
| 1640.0 | 55.216 |
| 1641.0 | 55.22 |
| 1642.0 | 55.253 |
| 1643.0 | 55.282 |
| 1644.0 | 55.336 |
| 1645.0 | 55.398 |
| 1646.0 | 55.431 |
| 1647.0 | 55.405 |
| 1648.0 | 55.362 |
| 1649.0 | 55.356 |
| 1650.0 | 55.351 |
| 1651.0 | 55.335 |
| 1652.0 | 55.328 |
| 1653.0 | 55.336 |
| 1654.0 | 55.342 |
| 1655.0 | 55.347 |
| 1656.0 | 55.348 |
| 1657.0 | 55.364 |
| 1658.0 | 55.379 |
| 1659.0 | 55.379 |
| 1660.0 | 55.376 |
| 1661.0 | 55.372 |
| 1662.0 | 55.364 |
| 1663.0 | 55.35 |
| 1664.0 | 55.349 |
| 1665.0 | 55.387 |
| 1666.0 | 55.435 |
| 1667.0 | 55.463 |
| 1668.0 | 55.502 |
| 1669.0 | 55.565 |
| 1670.0 | 55.598 |
| 1671.0 | 55.605 |
| 1672.0 | 55.602 |
| 1673.0 | 55.559 |
| 1674.0 | 55.52 |
| 1675.0 | 55.517 |
| 1676.0 | 55.507 |
| 1677.0 | 55.496 |
| 1678.0 | 55.512 |
| 1679.0 | 55.601 |
| 1680.0 | 55.712 |
| 1681.0 | 55.711 |
| 1682.0 | 55.642 |
| 1683.0 | 55.574 |
| 1684.0 | 55.505 |
| 1685.0 | 55.459 |
| 1686.0 | 55.426 |
| 1687.0 | 55.421 |
| 1688.0 | 55.5 |
| 1689.0 | 55.637 |
| 1690.0 | 55.731 |
| 1691.0 | 55.723 |
| 1692.0 | 55.665 |
| 1693.0 | 55.592 |
| 1694.0 | 55.507 |
| 1695.0 | 55.429 |
| 1696.0 | 55.414 |
| 1697.0 | 55.437 |
| 1698.0 | 55.464 |
| 1699.0 | 55.495 |
| 1700.0 | 55.515 |
| 1701.0 | 55.492 |
| 1702.0 | 55.432 |
| 1703.0 | 55.422 |
| 1704.0 | 55.45 |
| 1705.0 | 55.465 |
| 1706.0 | 55.439 |
| 1707.0 | 55.371 |
| 1708.0 | 55.296 |
| 1709.0 | 55.237 |
| 1710.0 | 55.198 |
| 1711.0 | 55.177 |
| 1712.0 | 55.178 |
| 1713.0 | 55.25 |
| 1714.0 | 55.38 |
| 1715.0 | 55.534 |
| 1716.0 | 55.653 |
| 1717.0 | 55.638 |
| 1718.0 | 55.565 |
| 1719.0 | 55.492 |
| 1720.0 | 55.397 |
| 1721.0 | 55.268 |
| 1722.0 | 55.149 |
| 1723.0 | 55.15 |
| 1724.0 | 55.201 |
| 1725.0 | 55.257 |
| 1726.0 | 55.341 |
| 1727.0 | 55.422 |
| 1728.0 | 55.461 |
| 1729.0 | 55.492 |
| 1730.0 | 55.528 |
| 1731.0 | 55.555 |
| 1732.0 | 55.524 |
| 1733.0 | 55.44 |
| 1734.0 | 55.408 |
| 1735.0 | 55.404 |
| 1736.0 | 55.416 |
| 1737.0 | 55.424 |
| 1738.0 | 55.418 |
| 1739.0 | 55.399 |
| 1740.0 | 55.394 |
| 1741.0 | 55.404 |
| 1742.0 | 55.399 |
| 1743.0 | 55.371 |
| 1744.0 | 55.341 |
| 1745.0 | 55.32 |
| 1746.0 | 55.296 |
| 1747.0 | 55.262 |
| 1748.0 | 55.253 |
| 1749.0 | 55.355 |
| 1750.0 | 55.516 |
| 1751.0 | 55.636 |
| 1752.0 | 55.668 |
| 1753.0 | 55.69 |
| 1754.0 | 55.702 |
| 1755.0 | 55.65 |
| 1756.0 | 55.574 |
| 1757.0 | 55.52 |
| 1758.0 | 55.497 |
| 1759.0 | 55.476 |
| 1760.0 | 55.439 |
| 1761.0 | 55.369 |
| 1762.0 | 55.291 |
| 1763.0 | 55.21 |
| 1764.0 | 55.164 |
| 1765.0 | 55.23 |
| 1766.0 | 55.327 |
| 1767.0 | 55.434 |
| 1768.0 | 55.54 |
| 1769.0 | 55.689 |
| 1770.0 | 55.812 |
| 1771.0 | 55.845 |
| 1772.0 | 55.816 |
| 1773.0 | 55.747 |
| 1774.0 | 55.665 |
| 1775.0 | 55.609 |
| 1776.0 | 55.636 |
| 1777.0 | 55.654 |
| 1778.0 | 55.593 |
| 1779.0 | 55.496 |
| 1780.0 | 55.44 |
| 1781.0 | 55.439 |
| 1782.0 | 55.429 |
| 1783.0 | 55.393 |
| 1784.0 | 55.424 |
| 1785.0 | 55.472 |
| 1786.0 | 55.541 |
| 1787.0 | 55.646 |
| 1788.0 | 55.756 |
| 1789.0 | 55.807 |
| 1790.0 | 55.828 |
| 1791.0 | 55.844 |
| 1792.0 | 55.846 |
| 1793.0 | 55.866 |
| 1794.0 | 55.879 |
| 1795.0 | 55.922 |
| 1796.0 | 56.041 |
| 1797.0 | 56.109 |
| 1798.0 | 56.063 |
| 1799.0 | 55.976 |
| 1800.0 | 55.915 |
| 1801.0 | 55.845 |
| 1802.0 | 55.815 |
| 1803.0 | 55.898 |
| 1804.0 | 55.959 |
| 1805.0 | 56.052 |
| 1806.0 | 56.154 |
| 1807.0 | 56.23 |
| 1808.0 | 56.167 |
| 1809.0 | 56.04 |
| 1810.0 | 56.018 |
| 1811.0 | 56.09 |
| 1812.0 | 56.196 |
| 1813.0 | 56.24 |
| 1814.0 | 56.343 |
| 1815.0 | 56.549 |
| 1816.0 | 56.703 |
| 1817.0 | 56.612 |
| 1818.0 | 56.275 |
| 1819.0 | 55.917 |
| 1820.0 | 55.898 |
| 1821.0 | 56.248 |
| 1822.0 | 56.569 |
| 1823.0 | 56.697 |
| 1824.0 | 56.661 |
| 1825.0 | 56.599 |
| 1826.0 | 56.569 |
| 1827.0 | 56.463 |
| 1828.0 | 56.28 |
| 1829.0 | 56.123 |
| 1830.0 | 56.242 |
| 1831.0 | 56.538 |
| 1832.0 | 56.618 |
| 1833.0 | 56.545 |
| 1834.0 | 56.397 |
| 1835.0 | 56.371 |
| 1836.0 | 56.441 |
| 1837.0 | 56.392 |
| 1838.0 | 56.162 |
| 1839.0 | 55.959 |
| 1840.0 | 56.031 |
| 1841.0 | 56.526 |
| 1842.0 | 57.153 |
| 1843.0 | 57.492 |
| 1844.0 | 57.225 |
| 1845.0 | 56.612 |
| 1846.0 | 56.022 |
| 1847.0 | 55.892 |
| 1848.0 | 56.168 |
| 1849.0 | 56.629 |
| 1850.0 | 57.105 |
| 1851.0 | 57.349 |
| 1852.0 | 57.184 |
| 1853.0 | 56.808 |
| 1854.0 | 56.514 |
| 1855.0 | 56.477 |
| 1856.0 | 56.582 |
| 1857.0 | 56.578 |
| 1858.0 | 56.507 |
| 1859.0 | 56.567 |
| 1860.0 | 56.759 |
| 1861.0 | 57.011 |
| 1862.0 | 57.119 |
| 1863.0 | 56.994 |
| 1864.0 | 56.945 |
| 1865.0 | 57.038 |
| 1866.0 | 57.114 |
| 1867.0 | 56.977 |
| 1868.0 | 56.829 |
| 1869.0 | 56.725 |
| 1870.0 | 56.936 |
| 1871.0 | 57.132 |
| 1872.0 | 57.062 |
| 1873.0 | 56.737 |
| 1874.0 | 56.198 |
| 1875.0 | 55.854 |
| 1876.0 | 56.171 |
| 1877.0 | 56.87 |
| 1878.0 | 57.49 |
| 1879.0 | 57.515 |
| 1880.0 | 57.126 |
| 1881.0 | 56.634 |
| 1882.0 | 56.398 |
| 1883.0 | 56.49 |
| 1884.0 | 56.823 |
| 1885.0 | 57.031 |
| 1886.0 | 57.188 |
| 1887.0 | 57.282 |
| 1888.0 | 57.246 |
| 1889.0 | 57.186 |
| 1890.0 | 57.106 |
| 1891.0 | 57.028 |
| 1892.0 | 57.098 |
| 1893.0 | 57.264 |
| 1894.0 | 57.348 |
| 1895.0 | 57.381 |
| 1896.0 | 57.275 |
| 1897.0 | 56.958 |
| 1898.0 | 56.753 |
| 1899.0 | 56.842 |
| 1900.0 | 57.21 |
| 1901.0 | 57.609 |
| 1902.0 | 57.688 |
| 1903.0 | 57.582 |
| 1904.0 | 57.451 |
| 1905.0 | 57.33 |
| 1906.0 | 57.461 |
| 1907.0 | 57.743 |
| 1908.0 | 57.877 |
| 1909.0 | 57.847 |
| 1910.0 | 57.614 |
| 1911.0 | 57.362 |
| 1912.0 | 57.234 |
| 1913.0 | 57.39 |
| 1914.0 | 57.724 |
| 1915.0 | 57.973 |
| 1916.0 | 57.952 |
| 1917.0 | 57.773 |
| 1918.0 | 57.452 |
| 1919.0 | 57.132 |
| 1920.0 | 57.054 |
| 1921.0 | 57.193 |
| 1922.0 | 57.465 |
| 1923.0 | 57.662 |
| 1924.0 | 57.507 |
| 1925.0 | 57.143 |
| 1926.0 | 56.879 |
| 1927.0 | 56.748 |
| 1928.0 | 56.855 |
| 1929.0 | 57.205 |
| 1930.0 | 57.589 |
| 1931.0 | 57.747 |
| 1932.0 | 57.563 |
| 1933.0 | 57.356 |
| 1934.0 | 57.336 |
| 1935.0 | 57.461 |
| 1936.0 | 57.677 |
| 1937.0 | 57.75 |
| 1938.0 | 57.637 |
| 1939.0 | 57.5 |
| 1940.0 | 57.346 |
| 1941.0 | 57.28 |
| 1942.0 | 57.395 |
| 1943.0 | 57.586 |
| 1944.0 | 57.731 |
| 1945.0 | 57.759 |
| 1946.0 | 57.544 |
| 1947.0 | 57.388 |
| 1948.0 | 57.361 |
| 1949.0 | 57.523 |
| 1950.0 | 57.799 |
| 1951.0 | 58.008 |
| 1952.0 | 58.062 |
| 1953.0 | 58.088 |
| 1954.0 | 58.103 |
| 1955.0 | 58.069 |
| 1956.0 | 58.087 |
| 1957.0 | 58.204 |
| 1958.0 | 58.272 |
| 1959.0 | 58.317 |
| 1960.0 | 58.321 |
| 1961.0 | 58.332 |
| 1962.0 | 58.331 |
| 1963.0 | 58.311 |
| 1964.0 | 58.306 |
| 1965.0 | 58.386 |
| 1966.0 | 58.492 |
| 1967.0 | 58.617 |
| 1968.0 | 58.657 |
| 1969.0 | 58.68 |
| 1970.0 | 58.698 |
| 1971.0 | 58.682 |
| 1972.0 | 58.762 |
| 1973.0 | 58.814 |
| 1974.0 | 58.831 |
| 1975.0 | 58.88 |
| 1976.0 | 58.914 |
| 1977.0 | 58.95 |
| 1978.0 | 59.01 |
| 1979.0 | 59.005 |
| 1980.0 | 58.982 |
| 1981.0 | 58.923 |
| 1982.0 | 58.855 |
| 1983.0 | 58.848 |
| 1984.0 | 58.921 |
| 1985.0 | 58.953 |
| 1986.0 | 58.935 |
| 1987.0 | 58.956 |
| 1988.0 | 58.986 |
| 1989.0 | 58.956 |
| 1990.0 | 58.935 |
| 1991.0 | 58.939 |
| 1992.0 | 58.998 |
| 1993.0 | 59.039 |
| 1994.0 | 59.067 |
| 1995.0 | 59.121 |
| 1996.0 | 59.143 |
| 1997.0 | 59.109 |
| 1998.0 | 59.046 |
| 1999.0 | 59.01 |
| 2000.065834 | 59.025 |
| 2009.942668 | 59.069 |
| 2020.098566 | 59.147 |
| 2029.969298 | 59.327 |
| 2039.837 | 59.499 |
| 2049.98346 | 59.679 |
| 2059.844971 | 59.84 |
| 2069.985031 | 60.068 |
| 2079.840289 | 60.306 |
| 2089.973887 | 60.433 |
| 2099.822832 | 60.568 |
| 2109.949906 | 60.677 |
| 2119.792477 | 60.769 |
| 2129.912964 | 60.909 |
| 2140.030088 | 61.073 |
| 2149.862941 | 61.161 |
| 2159.973384 | 61.18 |
| 2169.799712 | 61.209 |
| 2179.903413 | 61.389 |
| 2190.003671 | 61.58 |
| 2199.820052 | 61.807 |
| 2209.913475 | 62 |
| 2219.723179 | 62.194 |
| 2229.809704 | 62.296 |
| 2239.892708 | 62.439 |
| 2249.692237 | 62.397 |
| 2259.76825 | 62.56 |
| 2269.840694 | 62.743 |
| 2279.909553 | 63.036 |
| 2289.695271 | 63.205 |
| 2299.757015 | 63.315 |
| 2309.815127 | 63.516 |
| 2319.869592 | 63.659 |
| 2329.641254 | 63.761 |
| 2339.688478 | 63.824 |
| 2349.732008 | 63.937 |
| 2359.771828 | 64.183 |
| 2369.80792 | 64.343 |
| 2379.840271 | 64.455 |
| 2389.590342 | 64.432 |
| 2399.615266 | 64.451 |
| 2409.6364 | 64.444 |
| 2419.65373 | 64.493 |
| 2429.667238 | 64.586 |
| 2439.676909 | 64.709 |
| 2449.682728 | 64.824 |
| 2459.684679 | 65.002 |
| 2469.682745 | 65.155 |
| 2479.676911 | 65.287 |
| 2489.667162 | 65.291 |
| 2499.653481 | 65.359 |
| 2509.635853 | 65.347 |
| 2519.614261 | 65.37 |
| 2529.588691 | 65.368 |
| 2539.559127 | 65.453 |
| 2549.525552 | 65.428 |
| 2559.487951 | 65.502 |
| 2569.722871 | 65.752 |
| 2579.677058 | 65.974 |
| 2589.627171 | 65.961 |
| 2599.573195 | 65.879 |
| 2609.515113 | 65.876 |
| 2619.452911 | 65.989 |
| 2629.662448 | 66.099 |
| 2639.591842 | 66.22 |
| 2649.517067 | 66.337 |
| 2659.438109 | 66.27 |
| 2669.630358 | 66.101 |
| 2679.542867 | 66.023 |
| 2689.451145 | 65.811 |
| 2699.630227 | 65.412 |
| 2709.529877 | 64.234 |
| 2719.425248 | 61.947 |
| 2729.591015 | 58.001 |
| 2739.477662 | 52.61 |
| 2749.359982 | 46.622 |
| 2759.512287 | 41.064 |
| 2769.385788 | 36.319 |
| 2779.528995 | 32.62 |
| 2789.393611 | 29.949 |
| 2799.527654 | 28.064 |
| 2809.383323 | 26.862 |
| 2819.508136 | 25.993 |
| 2829.354792 | 25.614 |
| 2839.47031 | 25.426 |
| 2849.30789 | 25.3 |
| 2859.414046 | 25.254 |
| 2869.515434 | 25.354 |
| 2879.339216 | 25.724 |
| 2889.431143 | 26.128 |
| 2899.24569 | 26.553 |
| 2909.328092 | 26.81 |
| 2919.40564 | 27.176 |
| 2929.206149 | 27.607 |
| 2939.274073 | 28.144 |
| 2949.337095 | 28.667 |
| 2959.395197 | 29.103 |
| 2969.17672 | 29.613 |
| 2979.225066 | 30.175 |
| 2989.268442 | 30.644 |
| 2999.306833 | 31.19 |
| 3009.34022 | 31.605 |
| 3019.368587 | 32.125 |
| 3029.391918 | 32.398 |
| 3039.139497 | 32.819 |
| 3049.152842 | 33.359 |
| 3059.1611 | 33.853 |
| 3069.164256 | 34.354 |
| 3079.162292 | 34.772 |
| 3089.155191 | 35.332 |
| 3099.142938 | 35.897 |
| 3109.125515 | 36.414 |
| 3119.102905 | 36.956 |
| 3129.075093 | 37.393 |
| 3139.311366 | 37.807 |
| 3149.272956 | 38.431 |
| 3159.229293 | 39.084 |
| 3169.18036 | 39.697 |
| 3179.126141 | 40.257 |
| 3189.066618 | 40.66 |
| 3199.27022 | 41.071 |
| 3209.199897 | 41.524 |
| 3219.124221 | 41.895 |
| 3229.043176 | 42.497 |
| 3239.224603 | 42.792 |
| 3249.132622 | 43.311 |
| 3259.035221 | 43.625 |
| 3269.199799 | 43.987 |
| 3279.091361 | 44.225 |
| 3288.977454 | 44.299 |
| 3299.125027 | 44.386 |
| 3308.999981 | 44.398 |
| 3319.136081 | 44.242 |
| 3328.999829 | 43.938 |
| 3339.124385 | 43.464 |
| 3348.976861 | 43.057 |
| 3359.089804 | 42.656 |
| 3368.930939 | 42.247 |
| 3379.0322 | 41.612 |
| 3389.127517 | 40.597 |
| 3398.951437 | 39.597 |
| 3409.034967 | 38.39 |
| 3419.112499 | 37.346 |
| 3428.919052 | 35.988 |
| 3438.984693 | 34.687 |
| 3449.044284 | 33.183 |
| 3458.833318 | 31.717 |
| 3468.880914 | 30.433 |
| 3478.922407 | 29.186 |
| 3488.957779 | 27.805 |
| 3498.987012 | 26.288 |
| 3509.010089 | 24.687 |
| 3519.026992 | 23.258 |
| 3529.037703 | 21.972 |
| 3538.779008 | 20.722 |
| 3548.777448 | 19.688 |
| 3558.769643 | 18.676 |
| 3568.755577 | 17.808 |
| 3578.997769 | 16.885 |
| 3588.970961 | 15.978 |
| 3598.937838 | 15.277 |
| 3608.898383 | 14.604 |
| 3618.852578 | 14.02 |
| 3628.800407 | 13.404 |
| 3638.74185 | 12.897 |
| 3648.938253 | 12.584 |
| 3658.866705 | 12.646 |
| 3668.788719 | 12.845 |
| 3678.704279 | 13 |
| 3688.874043 | 13.081 |
| 3698.776469 | 13.429 |
| 3708.672387 | 14.372 |
| 3718.821938 | 15.124 |
| 3728.704616 | 15.861 |
| 3738.840542 | 16.29 |
| 3748.709907 | 17.187 |
| 3758.832135 | 18.081 |
| 3768.688117 | 19.008 |
| 3778.796573 | 19.627 |
| 3788.639101 | 20.468 |
| 3798.733711 | 21.249 |
| 3808.821282 | 22.197 |
| 3818.643407 | 22.569 |
| 3828.717023 | 23 |
| 3838.783543 | 23.544 |
| 3848.585104 | 24.016 |
| 3858.637559 | 24.339 |
| 3868.682864 | 24.047 |
| 3878.720999 | 23.823 |
| 3888.751945 | 23.286 |
| 3898.518755 | 22.959 |
| 3908.535455 | 22.663 |
| 3918.54491 | 22.378 |
| 3928.547104 | 21.991 |
| 3938.542016 | 21.183 |
| 3948.52963 | 20.409 |
| 3958.509925 | 19.659 |
| 3968.482884 | 19.485 |
| 3978.70392 | 19.156 |
| 3988.661962 | 18.599 |
| 3998.612612 | 17.929 |
| 4008.555852 | 17.525 |
| 4018.491662 | 17.293 |
| 4028.6745 | 17.267 |
| 4038.595205 | 17.114 |
| 4048.508426 | 17.283 |
| 4058.414143 | 17.303 |
| 4068.56604 | 17.55 |
| 4078.456503 | 17.485 |
| 4088.592715 | 17.486 |
| 4098.467848 | 17.277 |
| 4108.588299 | 17.58 |
| 4118.448027 | 17.744 |
| 4128.552639 | 18.246 |
| 4138.396887 | 18.27 |
| 4148.485584 | 18.668 |
| 4158.566193 | 18.721 |
| 4168.386981 | 18.895 |
| 4178.45156 | 18.631 |
| 4188.507992 | 18.635 |
| 4198.305151 | 18.627 |
| 4208.345437 | 18.444 |
| 4218.377519 | 18.536 |
| 4228.401377 | 17.9 |
| 4238.416991 | 17.546 |
| 4248.424343 | 17.885 |
| 4258.423411 | 18.22 |
| 4268.414178 | 17.606 |
| 4278.396623 | 16.576 |
| 4288.370728 | 15.629 |
| 4298.336471 | 15.355 |
| 4308.293836 | 14.646 |
| 4318.2428 | 14.511 |
| 4328.431752 | 14.61 |
| 4338.363649 | 14.256 |
| 4348.287088 | 13.752 |
| 4358.20205 | 13.284 |
| 4368.356068 | 12.757 |
| 4378.253805 | 12.081 |
| 4388.390126 | 11.408 |
| 4398.270558 | 10.883 |
| 4408.389101 | 10.389 |
| 4418.252149 | 9.952 |
| 4428.352834 | 9.441 |
| 4438.198419 | 9.08 |
| 4448.281165 | 8.518 |
| 4458.354799 | 8.091 |
| 4468.173935 | 7.664 |
| 4478.229508 | 7.268 |
| 4488.275909 | 6.798 |
| 4498.313117 | 6.446 |
| 4508.096635 | 6.13 |
| 4518.115621 | 6.13 |
| 4528.125352 | 6.024 |
| 4538.125809 | 5.77 |
| 4548.11697 | 5.52 |
| 4558.098816 | 5.303 |
| 4568.071325 | 5.158 |
| 4578.277365 | 4.991 |
| 4588.230912 | 4.811 |
| 4598.175061 | 4.641 |
| 4608.109792 | 4.499 |
| 4618.035085 | 4.358 |
| 4628.192649 | 4.226 |
| 4638.098772 | 4.104 |
| 4647.995395 | 3.996 |
| 4658.123528 | 3.889 |
| 4668.000857 | 3.784 |
| 4678.109183 | 3.675 |
| 4687.967136 | 3.557 |
| 4698.05557 | 3.432 |
| 4708.133906 | 3.309 |
| 4717.962521 | 3.206 |
| 4728.020838 | 3.116 |
| 4738.068993 | 3.034 |
| 4748.106964 | 2.955 |
| 4758.13473 | 2.875 |
| 4767.913874 | 2.799 |
| 4777.921408 | 2.728 |
| 4787.918673 | 2.662 |
| 4797.905646 | 2.596 |
| 4807.882307 | 2.527 |
| 4818.085802 | 2.461 |
| 4828.041526 | 2.409 |
| 4837.986874 | 2.358 |
| 4847.921823 | 2.306 |
| 4857.846351 | 2.253 |
| 4867.996361 | 2.202 |
| 4877.899737 | 2.154 |
| 4888.028045 | 2.105 |
| 4897.910179 | 2.063 |
| 4908.016697 | 2.021 |
| 4917.877504 | 1.988 |
| 4927.962141 | 1.95 |
| 4937.801534 | 1.917 |
| 4947.864203 | 1.88 |
| 4957.915724 | 1.843 |
| 4967.956075 | 1.807 |
| 4977.985234 | 1.774 |
| 4987.77033 | 1.746 |
| 4997.777298 | 1.713 |
| 5007.776688 | 1.68 |
| 5017.595804 | 1.651 |
| 5028.169082 | 1.619 |
| 5037.98605 | 1.589 |
| 5047.80198 | 1.561 |
| 5057.616872 | 1.536 |
| 5068.18559 | 1.512 |
| 5077.998316 | 1.486 |
| 5087.809996 | 1.463 |
| 5097.620628 | 1.44 |
| 5107.430211 | 1.418 |
| 5117.993201 | 1.396 |
| 5127.800597 | 1.377 |
| 5137.606938 | 1.358 |
| 5147.41222 | 1.337 |
| 5157.970569 | 1.317 |
| 5167.773648 | 1.298 |
| 5177.575662 | 1.28 |
| 5187.376611 | 1.264 |
| 5197.930283 | 1.248 |
| 5207.729011 | 1.232 |
| 5217.526666 | 1.216 |
| 5227.323247 | 1.201 |
| 5237.872207 | 1.188 |
| 5247.666549 | 1.177 |
| 5257.459812 | 1.165 |
| 5268.005191 | 1.153 |
| 5277.796202 | 1.141 |
| 5287.586127 | 1.128 |
| 5297.374963 | 1.114 |
| 5307.915566 | 1.102 |
| 5317.702134 | 1.088 |
| 5327.487607 | 1.076 |
| 5337.271982 | 1.065 |
| 5347.807773 | 1.052 |
| 5357.589864 | 1.041 |
| 5367.370852 | 1.029 |
| 5377.902987 | 1.019 |
| 5387.681677 | 1.008 |
| 5397.459258 | 0.998 |
| 5407.235727 | 0.989 |
| 5417.762987 | 0.979 |
| 5427.537141 | 0.969 |
| 5437.310177 | 0.962 |
| 5447.833734 | 0.955 |
| 5457.604442 | 0.948 |
| 5467.374028 | 0.938 |
| 5477.142487 | 0.929 |
| 5487.661104 | 0.919 |
| 5497.427219 | 0.911 |
| 5507.192201 | 0.903 |
| 5517.707068 | 0.894 |
| 5527.469693 | 0.886 |
| 5537.231179 | 0.878 |
| 5547.742274 | 0.871 |
| 5557.50139 | 0.866 |
| 5567.259362 | 0.86 |
| 5577.766665 | 0.853 |
| 5587.522253 | 0.846 |
| 5597.276691 | 0.84 |
| 5607.780182 | 0.833 |
| 5617.532223 | 0.829 |
| 5627.283108 | 0.824 |
| 5637.032835 | 0.818 |
| 5647.531242 | 0.812 |
| 5657.278555 | 0.807 |
| 5667.024703 | 0.803 |
| 5677.51925 | 0.797 |
| 5687.262972 | 0.79 |
| 5697.005523 | 0.784 |
| 5707.496189 | 0.779 |
| 5717.236302 | 0.773 |
| 5726.975237 | 0.769 |
| 5737.462002 | 0.766 |
| 5747.198485 | 0.764 |
| 5757.682605 | 0.759 |
| 5767.416629 | 0.753 |
| 5777.149464 | 0.748 |
| 5787.629649 | 0.744 |
| 5797.360012 | 0.74 |
| 5807.08918 | 0.736 |
| 5817.565409 | 0.73 |
| 5827.292092 | 0.728 |
| 5837.017575 | 0.722 |
| 5847.489828 | 0.717 |
| 5857.212813 | 0.714 |
| 5866.934591 | 0.709 |
| 5877.402847 | 0.704 |
| 5887.122114 | 0.7 |
| 5897.587661 | 0.695 |
| 5907.304408 | 0.691 |
| 5917.019938 | 0.689 |
| 5927.481454 | 0.685 |
| 5937.194452 | 0.681 |
| 5946.906226 | 0.677 |
| 5957.363691 | 0.673 |
| 5967.072921 | 0.67 |
| 5977.52764 | 0.667 |
| 5987.234315 | 0.663 |
| 5996.939757 | 0.659 |
| 6007.39039 | 0.659 |
| 6017.093265 | 0.657 |
| 6026.794901 | 0.654 |
| 6037.241429 | 0.651 |
| 6046.940485 | 0.65 |
| 6057.38423 | 0.649 |
| 6067.080698 | 0.647 |
| 6076.775917 | 0.645 |
| 6087.215522 | 0.641 |
| 6096.908139 | 0.638 |
| 6107.344938 | 0.636 |
| 6117.034946 | 0.633 |
| 6126.723694 | 0.63 |
| 6137.156319 | 0.628 |
| 6146.842444 | 0.625 |
| 6157.272241 | 0.622 |
| 6166.955735 | 0.619 |
| 6177.382693 | 0.617 |
| 6187.063548 | 0.614 |
| 6196.743128 | 0.611 |
| 6207.165865 | 0.607 |
| 6216.842793 | 0.604 |
| 6227.262668 | 0.601 |
| 6236.936935 | 0.598 |
| 6246.609918 | 0.596 |
| 6257.025537 | 0.594 |
| 6266.695846 | 0.591 |
| 6277.108582 | 0.588 |
| 6286.776208 | 0.585 |
| 6297.18605 | 0.583 |
| 6306.850986 | 0.581 |
| 6317.257926 | 0.578 |
| 6326.920162 | 0.576 |
| 6336.581095 | 0.573 |
| 6346.983717 | 0.571 |
| 6356.641938 | 0.568 |
| 6367.041635 | 0.566 |
| 6376.697135 | 0.564 |
| 6387.093897 | 0.564 |
| 6396.746668 | 0.563 |
| 6407.140486 | 0.562 |
| 6416.790518 | 0.559 |
| 6427.181383 | 0.558 |
| 6436.828669 | 0.556 |
| 6446.47463 | 0.555 |
| 6456.861103 | 0.553 |
| 6466.504304 | 0.55 |
| 6476.8878 | 0.548 |
| 6486.528234 | 0.546 |
| 6496.908745 | 0.544 |
| 6506.546402 | 0.541 |
| 6516.923919 | 0.538 |
| 6526.558791 | 0.537 |
| 6536.933304 | 0.535 |
| 6546.565382 | 0.533 |
| 6556.936882 | 0.532 |
| 6566.566159 | 0.531 |
| 6576.934637 | 0.529 |
| 6586.561102 | 0.527 |
| 6596.926549 | 0.525 |
| 6606.550195 | 0.524 |
| 6616.912601 | 0.522 |
| 6626.53342 | 0.52 |
| 6636.892776 | 0.519 |
| 6646.510758 | 0.518 |
| 6656.867055 | 0.517 |
| 6666.482193 | 0.515 |
| 6676.835422 | 0.513 |
| 6686.447706 | 0.511 |
| 6696.797857 | 0.51 |
| 6706.40728 | 0.508 |
| 6716.754344 | 0.507 |
| 6726.360896 | 0.505 |
| 6736.704865 | 0.503 |
| 6746.308538 | 0.504 |
| 6756.649402 | 0.503 |
| 6766.250188 | 0.503 |
| 6776.587937 | 0.501 |
| 6786.924068 | 0.5 |
| 6796.520453 | 0.498 |
| 6806.853456 | 0.496 |
| 6816.446931 | 0.496 |
| 6826.776797 | 0.496 |
| 6836.367355 | 0.496 |
| 6846.694074 | 0.494 |
| 6856.281707 | 0.492 |
| 6866.60527 | 0.491 |
| 6876.189968 | 0.49 |
| 6886.510366 | 0.49 |
| 6896.82912 | 0.49 |
| 6906.409345 | 0.49 |
| 6916.724921 | 0.489 |
| 6926.30219 | 0.487 |
| 6936.614577 | 0.487 |
| 6946.188882 | 0.485 |
| 6956.498072 | 0.483 |
| 6966.805601 | 0.482 |
| 6976.375388 | 0.481 |
| 6986.679706 | 0.479 |
| 6996.246507 | 0.477 |
| 7006.547605 | 0.475 |
| 7016.111412 | 0.474 |
| 7026.40928 | 0.472 |
| 7036.70547 | 0.471 |
| 7046.264714 | 0.469 |
| 7056.557661 | 0.468 |
| 7066.113889 | 0.466 |
| 7076.403584 | 0.465 |
| 7086.691589 | 0.464 |
| 7096.243221 | 0.463 |
| 7106.527959 | 0.462 |
| 7116.076554 | 0.461 |
| 7126.358018 | 0.46 |
| 7136.637779 | 0.459 |
| 7146.181746 | 0.457 |
| 7156.458218 | 0.456 |
| 7165.999126 | 0.455 |
| 7176.2723 | 0.454 |
| 7186.54376 | 0.453 |
| 7196.080008 | 0.452 |
| 7206.348156 | 0.451 |
| 7216.614582 | 0.449 |
| 7226.14615 | 0.448 |
| 7236.409251 | 0.447 |
| 7245.937725 | 0.445 |
| 7256.197491 | 0.444 |
| 7266.455524 | 0.444 |
| 7275.979286 | 0.442 |
| 7286.23397 | 0.441 |
| 7296.486914 | 0.44 |
| 7306.005944 | 0.439 |
| 7316.255525 | 0.437 |
| 7326.503358 | 0.436 |
| 7336.017637 | 0.436 |
| 7346.262094 | 0.435 |
| 7356.504797 | 0.435 |
| 7366.014304 | 0.434 |
| 7376.253616 | 0.432 |
| 7386.491167 | 0.431 |
| 7395.995884 | 0.43 |
| 7406.23003 | 0.428 |
| 7416.462408 | 0.427 |
| 7425.962315 | 0.426 |
| 7436.191274 | 0.425 |
| 7446.418458 | 0.424 |
| 7455.913536 | 0.423 |
| 7466.137287 | 0.421 |
| 7476.359256 | 0.42 |
| 7485.849485 | 0.42 |
| 7496.068008 | 0.418 |
| 7506.284741 | 0.418 |
| 7515.770101 | 0.417 |
| 7525.983375 | 0.417 |
| 7536.19485 | 0.418 |
| 7545.675324 | 0.418 |
| 7555.883326 | 0.417 |
| 7566.089524 | 0.416 |
| 7576.293916 | 0.415 |
| 7585.767802 | 0.413 |
| 7595.968701 | 0.413 |
| 7606.167786 | 0.412 |
| 7615.636739 | 0.411 |
| 7625.832319 | 0.41 |
| 7636.026078 | 0.409 |
| 7646.218013 | 0.408 |
| 7655.680318 | 0.407 |
| 7665.868729 | 0.406 |
| 7676.05531 | 0.405 |
| 7686.240057 | 0.404 |
| 7695.695679 | 0.403 |
| 7705.876884 | 0.402 |
| 7716.056248 | 0.401 |
| 7726.23377 | 0.4 |
| 7735.682674 | 0.399 |
| 7745.856636 | 0.398 |
| 7756.028747 | 0.397 |
| 7766.199006 | 0.396 |
| 7775.641157 | 0.395 |
| 7785.807837 | 0.395 |
| 7795.972657 | 0.393 |
| 7806.135616 | 0.392 |
| 7815.57098 | 0.391 |
| 7825.730341 | 0.39 |
| 7835.887833 | 0.389 |
| 7846.043454 | 0.389 |
| 7855.471995 | 0.388 |
| 7865.624 | 0.387 |
| 7875.774127 | 0.386 |
| 7885.922372 | 0.385 |
| 7896.068734 | 0.384 |
| 7905.488668 | 0.384 |
| 7915.631391 | 0.383 |
| 7925.772224 | 0.382 |
| 7935.911164 | 0.382 |
| 7946.048209 | 0.381 |
| 7955.45948 | 0.38 |
| 7965.592863 | 0.379 |
| 7975.724343 | 0.378 |
| 7985.853919 | 0.378 |
| 7995.981587 | 0.377 |
| 8005.384141 | 0.377 |
| 8015.508125 | 0.377 |
| 8025.630194 | 0.377 |
| 8035.750346 | 0.377 |
| 8045.86858 | 0.377 |
| 8055.984892 | 0.376 |
| 8065.376887 | 0.375 |
| 8075.489487 | 0.374 |
| 8085.600158 | 0.374 |
| 8095.708897 | 0.374 |
| 8105.815704 | 0.373 |
| 8115.920574 | 0.372 |
| 8125.301933 | 0.372 |
| 8135.403063 | 0.372 |
| 8145.502251 | 0.371 |
| 8155.599493 | 0.37 |
| 8165.694787 | 0.369 |
| 8175.788131 | 0.369 |
| 8185.879523 | 0.368 |
| 8195.248351 | 0.368 |
| 8205.33597 | 0.367 |
| 8215.42163 | 0.366 |
| 8225.505327 | 0.366 |
| 8235.587061 | 0.365 |
| 8245.666827 | 0.365 |
| 8255.744624 | 0.364 |
| 8265.82045 | 0.364 |
| 8275.174806 | 0.363 |
| 8285.246822 | 0.362 |
| 8295.31686 | 0.362 |
| 8305.384917 | 0.361 |
| 8315.45099 | 0.361 |
| 8325.515077 | 0.36 |
| 8335.577176 | 0.359 |
| 8345.637284 | 0.359 |
| 8355.695399 | 0.358 |
| 8365.751519 | 0.358 |
| 8375.087555 | 0.358 |
| 8385.139819 | 0.358 |
| 8395.190081 | 0.357 |
| 8405.238338 | 0.357 |
| 8415.284587 | 0.356 |
| 8425.328827 | 0.355 |
| 8435.371055 | 0.355 |
| 8445.411268 | 0.355 |
| 8455.449464 | 0.356 |
| 8465.485641 | 0.356 |
| 8475.519796 | 0.356 |
| 8485.551927 | 0.355 |
| 8495.582031 | 0.354 |
| 8505.610107 | 0.354 |
| 8515.636151 | 0.353 |
| 8525.660162 | 0.353 |
| 8535.682136 | 0.353 |
| 8544.98643 | 0.354 |
| 8555.004471 | 0.354 |
| 8565.020468 | 0.354 |
| 8575.034421 | 0.353 |
| 8585.046325 | 0.353 |
| 8595.056179 | 0.352 |
| 8605.063981 | 0.352 |
| 8615.069727 | 0.351 |
| 8625.073416 | 0.351 |
| 8635.075045 | 0.351 |
| 8645.074612 | 0.351 |
| 8655.072114 | 0.35 |
| 8665.067549 | 0.349 |
| 8675.060915 | 0.349 |
| 8685.052209 | 0.348 |
| 8695.041429 | 0.347 |
| 8705.028573 | 0.347 |
| 8715.013637 | 0.346 |
| 8724.99662 | 0.345 |
| 8734.977519 | 0.344 |
| 8744.956333 | 0.344 |
| 8754.933058 | 0.344 |
| 8764.907692 | 0.344 |
| 8774.880232 | 0.344 |
| 8784.850677 | 0.343 |
| 8794.819025 | 0.343 |
| 8804.785271 | 0.342 |
| 8815.461059 | 0.341 |
| 8825.422948 | 0.341 |
| 8835.382728 | 0.34 |
| 8845.340399 | 0.339 |
| 8855.295957 | 0.339 |
| 8865.249401 | 0.339 |
| 8875.200727 | 0.339 |
| 8885.149933 | 0.338 |
| 8895.097018 | 0.338 |
| 8905.041978 | 0.337 |
| 8914.984812 | 0.336 |
| 8924.925517 | 0.336 |
| 8934.86409 | 0.336 |
| 8944.800529 | 0.336 |
| 8954.734832 | 0.336 |
| 8965.376355 | 0.336 |
| 8975.306225 | 0.335 |
| 8985.233952 | 0.335 |
| 8995.159534 | 0.334 |
| 9005.082967 | 0.333 |
| 9015.004249 | 0.333 |
| 9024.923378 | 0.332 |
| 9034.840353 | 0.332 |
| 9044.755169 | 0.331 |
| 9054.667825 | 0.331 |
| 9065.286129 | 0.33 |
| 9075.194303 | 0.33 |
| 9085.10031 | 0.329 |
| 9095.004147 | 0.329 |
| 9104.905813 | 0.328 |
| 9114.805303 | 0.328 |
| 9124.702617 | 0.328 |
| 9134.597752 | 0.327 |
| 9145.197262 | 0.327 |
| 9155.087875 | 0.327 |
| 9164.976302 | 0.328 |
| 9174.86254 | 0.327 |
| 9184.746587 | 0.327 |
| 9194.628441 | 0.327 |
| 9204.508098 | 0.327 |
| 9215.091006 | 0.327 |
| 9224.966108 | 0.327 |
| 9234.839006 | 0.327 |
| 9244.709699 | 0.327 |
| 9254.578185 | 0.327 |
| 9265.149109 | 0.326 |
| 9275.013013 | 0.326 |
| 9284.874702 | 0.325 |
| 9294.734174 | 0.325 |
| 9304.591426 | 0.324 |
| 9314.446456 | 0.324 |
| 9325.002949 | 0.323 |
| 9334.853368 | 0.323 |
| 9344.701558 | 0.323 |
| 9354.547517 | 0.322 |
| 9364.391241 | 0.322 |
| 9374.935607 | 0.321 |
| 9384.774696 | 0.321 |
| 9394.611544 | 0.32 |
| 9404.446148 | 0.32 |
| 9414.980732 | 0.319 |
| 9424.810682 | 0.319 |
| 9434.63838 | 0.318 |
| 9444.463825 | 0.318 |
| 9454.988585 | 0.318 |
| 9464.809356 | 0.317 |
| 9474.627866 | 0.317 |
| 9484.444114 | 0.317 |
| 9494.959008 | 0.316 |
| 9504.770561 | 0.316 |
| 9514.579844 | 0.315 |
| 9524.386855 | 0.315 |
| 9534.891842 | 0.314 |
| 9544.694139 | 0.314 |
| 9554.494156 | 0.313 |
| 9564.291891 | 0.313 |
| 9574.786929 | 0.312 |
| 9584.57993 | 0.312 |
| 9594.370643 | 0.312 |
| 9604.858149 | 0.312 |
| 9614.644112 | 0.312 |
| 9624.427779 | 0.312 |
| 9634.209147 | 0.311 |
| 9644.686632 | 0.311 |
| 9654.463232 | 0.31 |
| 9664.237526 | 0.31 |
| 9674.707423 | 0.31 |
| 9684.476934 | 0.31 |
| 9694.244132 | 0.31 |
| 9704.706417 | 0.309 |
| 9714.468817 | 0.309 |
| 9724.228897 | 0.308 |
| 9734.683548 | 0.308 |
| 9744.438814 | 0.307 |
| 9754.191753 | 0.307 |
| 9764.638746 | 0.307 |
| 9774.386857 | 0.306 |
| 9784.132634 | 0.306 |
| 9794.571945 | 0.306 |
| 9804.312879 | 0.305 |
| 9814.746996 | 0.305 |
| 9824.483078 | 0.305 |
| 9834.216813 | 0.305 |
| 9844.643209 | 0.305 |
| 9854.372076 | 0.305 |
| 9864.09859 | 0.305 |
| 9874.517241 | 0.305 |
| 9884.238873 | 0.305 |
| 9894.652288 | 0.305 |
| 9904.369027 | 0.304 |
| 9914.083402 | 0.304 |
| 9924.489032 | 0.303 |
| 9934.198499 | 0.303 |
| 9944.598867 | 0.303 |
| 9954.303417 | 0.302 |
| 9964.00559 | 0.302 |
| 9974.398135 | 0.301 |
| 9984.095376 | 0.301 |
| 9994.482631 | 0.3 |
| 10004.17493 | 0.3 |
| 10014.55689 | 0.3 |
| 10024.24423 | 0.3 |
| 10033.92919 | 0.299 |
| 10044.30326 | 0.299 |
| 10053.98325 | 0.298 |
| 10064.352 | 0.298 |
| 10074.02701 | 0.298 |
| 10084.39043 | 0.298 |
| 10094.06045 | 0.298 |
| 10104.41852 | 0.298 |
| 10114.08355 | 0.298 |
| 10124.43625 | 0.298 |
| 10134.09628 | 0.298 |
| 10144.44362 | 0.297 |
| 10154.09862 | 0.297 |
| 10164.44058 | 0.297 |
| 10174.09056 | 0.297 |
| 10184.42713 | 0.296 |
| 10194.07208 | 0.296 |
| 10204.40325 | 0.296 |
| 10214.04315 | 0.296 |
| 10224.36891 | 0.295 |
| 10234.00375 | 0.295 |
| 10244.32409 | 0.295 |
| 10253.95386 | 0.294 |
| 10264.26877 | 0.294 |
| 10273.89347 | 0.294 |
| 10284.20293 | 0.293 |
| 10293.82255 | 0.293 |
| 10304.12656 | 0.293 |
| 10313.74108 | 0.293 |
| 10324.03963 | 0.293 |
| 10334.33534 | 0.292 |
| 10343.94211 | 0.292 |
| 10354.23234 | 0.292 |
| 10363.834 | 0.292 |
| 10374.11874 | 0.291 |
| 10383.71527 | 0.291 |
| 10393.99451 | 0.291 |
| 10404.2709 | 0.29 |
| 10413.85962 | 0.29 |
| 10424.1305 | 0.291 |
| 10433.71407 | 0.29 |
| 10443.97941 | 0.29 |
| 10454.2419 | 0.291 |
| 10463.81763 | 0.29 |
| 10474.07457 | 0.29 |
| 10483.64512 | 0.29 |
| 10493.8965 | 0.289 |
| 10504.14501 | 0.289 |
| 10513.70769 | 0.289 |
| 10523.95063 | 0.289 |
| 10534.19068 | 0.288 |
| 10543.74545 | 0.288 |
| 10553.97992 | 0.288 |
| 10564.21149 | 0.288 |
| 10573.75835 | 0.287 |
| 10583.98432 | 0.287 |
| 10593.52594 | 0.287 |
| 10603.7463 | 0.286 |
| 10613.96375 | 0.286 |
| 10624.17829 | 0.286 |
| 10633.70924 | 0.285 |
| 10643.91815 | 0.285 |
| 10654.12414 | 0.285 |
| 10663.64709 | 0.284 |
| 10673.84743 | 0.284 |
| 10684.04485 | 0.284 |
| 10693.55979 | 0.284 |
| 10703.75154 | 0.284 |
| 10713.94035 | 0.283 |
| 10723.44726 | 0.283 |
| 10733.6304 | 0.283 |
| 10743.81059 | 0.283 |
| 10753.98783 | 0.283 |
| 10763.48393 | 0.282 |
| 10773.65548 | 0.282 |
| 10783.82407 | 0.281 |
| 10793.9897 | 0.281 |
| 10803.47495 | 0.281 |
| 10813.63486 | 0.281 |
| 10823.7918 | 0.281 |
| 10833.94578 | 0.281 |
| 10843.42014 | 0.281 |
| 10853.56838 | 0.281 |
| 10863.71363 | 0.281 |
| 10873.85591 | 0.281 |
| 10883.31935 | 0.281 |
| 10893.45586 | 0.281 |
| 10903.58938 | 0.281 |
| 10913.71992 | 0.281 |
| 10923.84746 | 0.28 |
| 10933.29714 | 0.28 |
| 10943.41889 | 0.28 |
| 10953.53764 | 0.28 |
| 10963.65339 | 0.28 |
| 10973.76613 | 0.28 |
| 10983.87586 | 0.28 |
| 10993.3089 | 0.281 |
| 11003.41281 | 0.281 |
| 11013.5137 | 0.281 |
| 11023.61157 | 0.281 |
| 11033.70642 | 0.281 |
| 11043.79825 | 0.281 |
| 11053.21456 | 0.282 |
| 11063.30053 | 0.281 |
| 11073.38346 | 0.281 |
| 11083.46337 | 0.281 |
| 11093.54023 | 0.28 |
| 11103.61405 | 0.28 |
| 11113.68483 | 0.28 |
| 11123.75256 | 0.279 |
| 11133.14635 | 0.279 |
| 11143.20819 | 0.278 |
| 11153.26696 | 0.278 |
| 11163.32268 | 0.278 |
| 11173.37534 | 0.278 |
| 11183.42494 | 0.277 |
| 11193.47147 | 0.277 |
| 11203.51493 | 0.277 |
| 11213.55532 | 0.277 |
| 11223.59263 | 0.277 |
| 11233.62687 | 0.277 |
| 11243.65803 | 0.277 |
| 11253.6861 | 0.277 |
| 11263.71109 | 0.277 |
| 11273.06496 | 0.277 |
| 11283.08398 | 0.277 |
| 11293.09991 | 0.276 |
| 11303.11274 | 0.276 |
| 11313.12247 | 0.276 |
| 11323.12909 | 0.276 |
| 11333.13262 | 0.276 |
| 11343.13303 | 0.276 |
| 11353.13034 | 0.276 |
| 11363.12453 | 0.275 |
| 11373.11561 | 0.275 |
| 11383.10358 | 0.275 |
| 11393.08842 | 0.275 |
| 11403.07013 | 0.275 |
| 11413.04872 | 0.274 |
| 11423.02418 | 0.274 |
| 11432.99651 | 0.275 |
| 11442.96571 | 0.275 |
| 11452.93177 | 0.275 |
| 11463.55877 | 0.275 |
| 11473.51834 | 0.275 |
| 11483.47476 | 0.274 |
| 11493.42803 | 0.274 |
| 11503.37815 | 0.274 |
| 11513.32512 | 0.274 |
| 11523.26893 | 0.273 |
| 11533.20958 | 0.273 |
| 11543.14707 | 0.273 |
| 11553.0814 | 0.273 |
| 11563.01256 | 0.272 |
| 11572.94055 | 0.272 |
| 11582.86536 | 0.272 |
| 11593.44833 | 0.272 |
| 11603.36658 | 0.272 |
| 11613.28165 | 0.272 |
| 11623.19353 | 0.271 |
| 11633.10223 | 0.271 |
| 11643.00774 | 0.271 |
| 11652.91006 | 0.271 |
| 11662.80918 | 0.271 |
| 11673.36472 | 0.271 |
| 11683.25723 | 0.271 |
| 11693.14654 | 0.272 |
| 11703.03264 | 0.272 |
| 11712.91554 | 0.272 |
| 11722.79522 | 0.272 |
| 11733.33001 | 0.272 |
| 11743.20304 | 0.272 |
| 11753.07286 | 0.272 |
| 11762.93946 | 0.272 |
| 11772.80283 | 0.272 |
| 11783.3202 | 0.271 |
| 11793.1769 | 0.271 |
| 11803.03036 | 0.271 |
| 11812.88059 | 0.27 |
| 11822.72758 | 0.27 |
| 11833.22747 | 0.27 |
| 11843.06776 | 0.27 |
| 11852.9048 | 0.269 |
| 11862.73859 | 0.269 |
| 11873.22439 | 0.269 |
| 11883.05145 | 0.268 |
| 11892.87526 | 0.268 |
| 11902.69581 | 0.268 |
| 11913.16747 | 0.268 |
| 11922.98127 | 0.268 |
| 11932.79181 | 0.268 |
| 11942.59907 | 0.268 |
| 11953.05654 | 0.268 |
| 11962.85704 | 0.268 |
| 11972.65425 | 0.268 |
| 11983.10099 | 0.268 |
| 11992.89142 | 0.267 |
| 12002.67856 | 0.267 |
| 12013.11455 | 0.267 |
| 12022.89488 | 0.267 |
| 12032.67192 | 0.267 |
| 12043.09713 | 0.267 |
| 12052.86735 | 0.267 |
| 12062.63426 | 0.267 |
| 12073.04866 | 0.267 |
| 12082.80874 | 0.267 |
| 12092.5655 | 0.267 |
| 12102.96906 | 0.266 |
| 12112.71897 | 0.266 |
| 12122.46556 | 0.266 |
| 12132.85826 | 0.266 |
| 12142.59798 | 0.265 |
| 12152.98334 | 0.265 |
| 12162.71618 | 0.265 |
| 12172.44568 | 0.265 |
| 12182.82013 | 0.265 |
| 12192.54273 | 0.265 |
| 12202.90982 | 0.264 |
| 12212.62551 | 0.264 |
| 12222.98523 | 0.265 |
| 12232.69399 | 0.265 |
| 12242.39941 | 0.265 |
| 12252.74815 | 0.265 |
| 12262.44662 | 0.264 |
| 12272.78796 | 0.264 |
| 12282.47948 | 0.264 |
| 12292.81339 | 0.264 |
| 12302.49796 | 0.264 |
| 12312.82444 | 0.264 |
| 12322.50203 | 0.264 |
| 12332.82106 | 0.265 |
| 12342.49167 | 0.265 |
| 12352.80325 | 0.265 |
| 12362.46686 | 0.265 |
| 12372.77097 | 0.265 |
| 12382.42757 | 0.265 |
| 12392.7242 | 0.265 |
| 12402.37378 | 0.265 |
| 12412.66292 | 0.265 |
| 12422.30547 | 0.266 |
| 12432.58711 | 0.266 |
| 12442.22262 | 0.266 |
| 12452.49673 | 0.265 |
| 12462.76697 | 0.266 |
| 12472.39178 | 0.265 |
| 12482.65448 | 0.265 |
| 12492.27222 | 0.265 |
| 12502.52738 | 0.265 |
| 12512.77863 | 0.265 |
| 12522.38563 | 0.265 |
| 12532.62932 | 0.264 |
| 12542.22922 | 0.264 |
| 12552.46533 | 0.264 |
| 12562.69753 | 0.264 |
| 12572.28665 | 0.264 |
| 12582.51125 | 0.264 |
| 12592.73192 | 0.263 |
| 12602.31024 | 0.263 |
| 12612.5233 | 0.263 |
| 12622.09447 | 0.263 |
| 12632.29991 | 0.263 |
| 12642.5014 | 0.262 |
| 12652.69895 | 0.262 |
| 12662.25557 | 0.262 |
| 12672.44547 | 0.262 |
| 12682.63142 | 0.262 |
| 12692.17715 | 0.262 |
| 12702.35544 | 0.262 |
| 12712.52975 | 0.261 |
| 12722.06458 | 0.261 |
| 12732.23121 | 0.261 |
| 12742.39387 | 0.261 |
| 12752.55256 | 0.261 |
| 12762.07271 | 0.261 |
| 12772.22369 | 0.261 |
| 12782.37068 | 0.261 |
| 12792.51369 | 0.261 |
| 12802.01913 | 0.261 |
| 12812.1544 | 0.261 |
| 12822.28568 | 0.261 |
| 12832.41295 | 0.261 |
| 12842.53622 | 0.261 |
| 12852.02315 | 0.261 |
| 12862.13866 | 0.261 |
| 12872.25016 | 0.261 |
| 12882.35764 | 0.261 |
| 12892.4611 | 0.261 |
| 12901.92944 | 0.261 |
| 12912.02511 | 0.261 |
| 12922.11675 | 0.261 |
| 12932.20436 | 0.261 |
| 12942.28794 | 0.261 |
| 12952.36747 | 0.261 |
| 12962.44297 | 0.261 |
| 12971.88508 | 0.261 |
| 12981.95274 | 0.261 |
| 12992.01635 | 0.261 |
| 13002.07591 | 0.261 |
| 13012.13141 | 0.261 |
| 13022.18286 | 0.261 |
| 13032.23024 | 0.261 |
| 13042.27356 | 0.261 |
| 13052.31281 | 0.261 |
| 13062.34799 | 0.261 |
| 13072.37909 | 0.261 |
| 13081.77955 | 0.261 |
| 13091.80275 | 0.261 |
| 13101.82186 | 0.261 |
| 13111.83689 | 0.261 |
| 13121.84783 | 0.261 |
| 13131.85468 | 0.26 |
| 13141.85743 | 0.26 |
| 13151.85608 | 0.26 |
| 13161.85063 | 0.26 |
| 13171.84107 | 0.26 |
| 13181.8274 | 0.26 |
| 13191.80963 | 0.26 |
| 13201.78774 | 0.26 |
| 13211.76172 | 0.26 |
| 13221.73159 | 0.26 |
| 13231.69734 | 0.26 |
| 13241.65895 | 0.26 |
| 13252.23865 | 0.26 |
| 13262.19174 | 0.26 |
| 13272.1407 | 0.26 |
| 13282.08552 | 0.26 |
| 13292.02619 | 0.26 |
| 13301.96272 | 0.26 |
| 13311.8951 | 0.26 |
| 13321.82333 | 0.26 |
| 13331.7474 | 0.26 |
| 13341.66731 | 0.26 |
| 13351.58306 | 0.26 |
| 13362.11398 | 0.26 |
| 13372.02114 | 0.26 |
| 13381.92413 | 0.26 |
| 13391.82294 | 0.26 |
| 13401.71758 | 0.26 |
| 13411.60803 | 0.26 |
| 13422.11206 | 0.26 |
| 13431.99388 | 0.259 |
| 13441.87151 | 0.259 |
| 13451.74495 | 0.259 |
| 13461.6142 | 0.259 |
| 13472.09567 | 0.259 |
| 13481.95625 | 0.259 |
| 13491.81263 | 0.259 |
| 13501.66479 | 0.259 |
| 13511.51275 | 0.259 |
| 13521.97158 | 0.259 |
| 13531.81084 | 0.259 |
| 13541.64588 | 0.259 |
| 13551.47669 | 0.258 |
| 13561.9173 | 0.258 |
| 13571.7394 | 0.258 |
| 13581.55725 | 0.258 |
| 13591.98409 | 0.258 |
| 13601.79321 | 0.258 |
| 13611.59808 | 0.258 |
| 13621.39871 | 0.258 |
| 13631.80722 | 0.258 |
| 13641.59909 | 0.258 |
| 13651.38669 | 0.258 |
| 13661.78136 | 0.258 |
| 13671.56018 | 0.258 |
| 13681.94551 | 0.258 |
| 13691.71553 | 0.258 |
| 13701.48128 | 0.258 |
| 13711.85271 | 0.258 |
| 13721.60964 | 0.258 |
| 13731.3623 | 0.257 |
| 13741.7198 | 0.257 |
| 13751.46361 | 0.257 |
| 13761.81172 | 0.257 |
| 13771.54668 | 0.257 |
| 13781.88538 | 0.257 |
| 13791.61148 | 0.258 |
| 13801.33328 | 0.258 |
| 13811.65798 | 0.257 |
| 13821.37089 | 0.257 |
| 13831.68615 | 0.257 |
| 13841.39017 | 0.257 |
| 13851.69596 | 0.258 |
| 13861.39108 | 0.258 |
| 13871.6874 | 0.258 |
| 13881.37359 | 0.258 |
| 13891.66043 | 0.258 |
| 13901.33769 | 0.258 |
| 13911.61502 | 0.258 |
| 13921.28334 | 0.258 |
| 13931.55116 | 0.258 |
| 13941.21051 | 0.258 |
| 13951.46881 | 0.258 |
| 13961.72219 | 0.258 |
| 13971.36795 | 0.258 |
| 13981.61179 | 0.258 |
| 13991.24855 | 0.258 |
| 14001.48283 | 0.258 |
| 14011.71217 | 0.258 |
| 14021.33529 | 0.258 |
| 14031.55505 | 0.258 |
| 14041.16914 | 0.258 |
| 14051.37931 | 0.258 |
| 14061.58453 | 0.258 |
| 14071.18493 | 0.258 |
| 14081.38053 | 0.259 |
| 14091.57118 | 0.259 |
| 14101.15785 | 0.259 |
| 14111.33886 | 0.259 |
| 14121.51491 | 0.259 |
| 14131.08782 | 0.259 |
| 14141.25421 | 0.259 |
| 14151.41561 | 0.259 |
| 14161.57204 | 0.259 |
| 14171.12647 | 0.259 |
| 14181.27321 | 0.259 |
| 14191.41496 | 0.259 |
| 14201.55171 | 0.259 |
| 14211.08762 | 0.259 |
| 14221.21466 | 0.259 |
| 14231.33669 | 0.259 |
| 14241.45371 | 0.259 |
| 14250.97103 | 0.26 |
| 14261.07831 | 0.26 |
| 14271.18057 | 0.26 |
| 14281.27781 | 0.26 |
| 14291.37001 | 0.261 |
| 14301.45718 | 0.261 |
| 14310.94639 | 0.261 |
| 14321.02379 | 0.262 |
| 14331.09614 | 0.262 |
| 14341.16344 | 0.262 |
| 14351.2257 | 0.262 |
| 14361.2829 | 0.262 |
| 14371.33504 | 0.262 |
| 14381.38213 | 0.262 |
| 14391.42415 | 0.262 |
| 14400.87083 | 0.262 |
| 14410.90301 | 0.261 |
| 14420.93011 | 0.262 |
| 14430.95214 | 0.262 |
| 14440.96908 | 0.262 |
| 14450.98094 | 0.262 |
| 14460.98771 | 0.262 |
| 14470.98939 | 0.262 |
| 14480.98597 | 0.262 |
| 14490.97745 | 0.263 |
| 14500.96383 | 0.263 |
| 14510.9451 | 0.263 |
| 14520.92127 | 0.264 |
| 14530.89232 | 0.265 |
| 14540.85825 | 0.265 |
| 14550.81906 | 0.265 |
| 14560.77475 | 0.265 |
| 14571.31048 | 0.265 |
| 14581.25561 | 0.266 |
| 14591.19561 | 0.265 |
| 14601.13046 | 0.265 |
| 14611.06018 | 0.266 |
| 14620.98475 | 0.266 |
| 14630.90417 | 0.266 |
| 14640.81844 | 0.266 |
| 14650.72755 | 0.266 |
| 14661.21393 | 0.266 |
| 14671.11242 | 0.267 |
| 14681.00574 | 0.269 |
| 14690.89389 | 0.271 |
| 14700.77687 | 0.271 |
| 14710.65467 | 0.271 |
| 14721.10787 | 0.271 |
| 14730.975 | 0.271 |
| 14740.83695 | 0.271 |
| 14750.6937 | 0.272 |
| 14761.12461 | 0.272 |
| 14770.97066 | 0.272 |
| 14780.81152 | 0.272 |
| 14790.64717 | 0.273 |
| 14801.05571 | 0.273 |
| 14810.88064 | 0.274 |
| 14820.70034 | 0.276 |
| 14831.09199 | 0.278 |
| 14840.90095 | 0.279 |
| 14850.70469 | 0.28 |
| 14861.07941 | 0.28 |
| 14870.87237 | 0.28 |
| 14880.6601 | 0.28 |
| 14891.01786 | 0.28 |
| 14900.7948 | 0.281 |
| 14910.56649 | 0.282 |
| 14920.90726 | 0.284 |
| 14930.66813 | 0.285 |
| 14940.99744 | 0.284 |
| 14950.74749 | 0.285 |
| 14960.49227 | 0.286 |
| 14970.80453 | 0.287 |
| 14980.53846 | 0.288 |
| 14990.83922 | 0.288 |
| 15000.56229 | 0.287 |
| 15010.85154 | 0.288 |
| 15020.56373 | 0.289 |
| 15030.84146 | 0.29 |
| 15040.54275 | 0.289 |
| 15050.80894 | 0.29 |
| 15060.49932 | 0.292 |
| 15070.75395 | 0.294 |
| 15080.43342 | 0.294 |
| 15090.67647 | 0.294 |
| 15100.91357 | 0.294 |
| 15110.57647 | 0.294 |
| 15120.80197 | 0.296 |
| 15130.45391 | 0.297 |
| 15140.6678 | 0.298 |
| 15150.87571 | 0.298 |
| 15160.51103 | 0.298 |
| 15170.70731 | 0.298 |
| 15180.33163 | 0.299 |
| 15190.51626 | 0.299 |
| 15200.69489 | 0.299 |
| 15210.30253 | 0.3 |
| 15220.4695 | 0.301 |
| 15230.63045 | 0.301 |
| 15240.78539 | 0.302 |
| 15250.37064 | 0.302 |
| 15260.51388 | 0.302 |
| 15270.65109 | 0.302 |
| 15280.78227 | 0.302 |
| 15290.34507 | 0.303 |
| 15300.46452 | 0.304 |
| 15310.57793 | 0.306 |
| 15320.6853 | 0.307 |
| 15330.22559 | 0.308 |
| 15340.32119 | 0.308 |
| 15350.41073 | 0.309 |
| 15360.49422 | 0.31 |
| 15370.57164 | 0.31 |
| 15380.64299 | 0.312 |
| 15390.70827 | 0.313 |
| 15400.20879 | 0.314 |
| 15410.26225 | 0.314 |
| 15420.30963 | 0.313 |
| 15430.35092 | 0.313 |
| 15440.38612 | 0.313 |
| 15450.41522 | 0.314 |
| 15460.43823 | 0.315 |
| 15470.45513 | 0.315 |
| 15480.46592 | 0.315 |
| 15490.4706 | 0.315 |
| 15500.46917 | 0.316 |
| 15510.46161 | 0.316 |
| 15520.44794 | 0.317 |
| 15530.42813 | 0.318 |
| 15540.4022 | 0.317 |
| 15550.37013 | 0.317 |
| 15560.33192 | 0.317 |
| 15570.28757 | 0.318 |
| 15580.23707 | 0.318 |
| 15590.18042 | 0.318 |
| 15600.11761 | 0.319 |
| 15610.04865 | 0.32 |
| 15620.52472 | 0.321 |
| 15630.44309 | 0.321 |
| 15640.35528 | 0.321 |
| 15650.2613 | 0.322 |
| 15660.16114 | 0.321 |
| 15670.0548 | 0.321 |
| 15680.4914 | 0.321 |
| 15690.37234 | 0.321 |
| 15700.24708 | 0.321 |
| 15710.11563 | 0.321 |
| 15719.97797 | 0.322 |
| 15730.38149 | 0.321 |
| 15740.23107 | 0.321 |
| 15750.07444 | 0.321 |
| 15759.91159 | 0.321 |
| 15770.2885 | 0.321 |
| 15780.11286 | 0.321 |
| 15789.93098 | 0.322 |
| 15800.2878 | 0.322 |
| 15810.09311 | 0.322 |
| 15819.89218 | 0.322 |
| 15830.22886 | 0.321 |
| 15840.01509 | 0.322 |
| 15850.33821 | 0.322 |
| 15860.11158 | 0.322 |
| 15869.87869 | 0.322 |
| 15880.18161 | 0.322 |
| 15889.93584 | 0.321 |
| 15900.22516 | 0.323 |
| 15909.96648 | 0.324 |
| 15920.24218 | 0.323 |
| 15929.97059 | 0.324 |
| 15940.23264 | 0.324 |
| 15949.94812 | 0.325 |
| 15960.19652 | 0.326 |
| 15969.89905 | 0.327 |
| 15980.13377 | 0.327 |
| 15989.82334 | 0.327 |
| 16000.04436 | 0.327 |